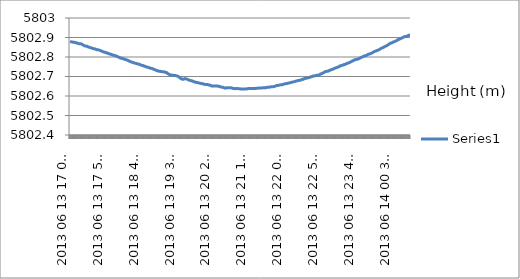
| Category | Series 0 |
|---|---|
| 2013 06 13 17 00 15 | 5802.88 |
| 2013 06 13 17 00 30 | 5802.88 |
| 2013 06 13 17 00 45 | 5802.879 |
| 2013 06 13 17 01 00 | 5802.879 |
| 2013 06 13 17 01 15 | 5802.878 |
| 2013 06 13 17 01 30 | 5802.878 |
| 2013 06 13 17 01 45 | 5802.878 |
| 2013 06 13 17 02 00 | 5802.877 |
| 2013 06 13 17 02 15 | 5802.878 |
| 2013 06 13 17 02 30 | 5802.877 |
| 2013 06 13 17 02 45 | 5802.877 |
| 2013 06 13 17 03 00 | 5802.877 |
| 2013 06 13 17 03 15 | 5802.877 |
| 2013 06 13 17 03 30 | 5802.877 |
| 2013 06 13 17 03 45 | 5802.877 |
| 2013 06 13 17 04 00 | 5802.876 |
| 2013 06 13 17 04 15 | 5802.877 |
| 2013 06 13 17 04 30 | 5802.876 |
| 2013 06 13 17 04 45 | 5802.875 |
| 2013 06 13 17 05 00 | 5802.876 |
| 2013 06 13 17 05 15 | 5802.874 |
| 2013 06 13 17 05 30 | 5802.875 |
| 2013 06 13 17 05 45 | 5802.875 |
| 2013 06 13 17 06 00 | 5802.874 |
| 2013 06 13 17 06 15 | 5802.875 |
| 2013 06 13 17 06 30 | 5802.874 |
| 2013 06 13 17 06 45 | 5802.873 |
| 2013 06 13 17 07 00 | 5802.874 |
| 2013 06 13 17 07 15 | 5802.873 |
| 2013 06 13 17 07 30 | 5802.873 |
| 2013 06 13 17 07 45 | 5802.873 |
| 2013 06 13 17 08 00 | 5802.873 |
| 2013 06 13 17 08 15 | 5802.873 |
| 2013 06 13 17 08 30 | 5802.873 |
| 2013 06 13 17 08 45 | 5802.873 |
| 2013 06 13 17 09 00 | 5802.873 |
| 2013 06 13 17 09 15 | 5802.872 |
| 2013 06 13 17 09 30 | 5802.872 |
| 2013 06 13 17 09 45 | 5802.872 |
| 2013 06 13 17 10 00 | 5802.872 |
| 2013 06 13 17 10 15 | 5802.871 |
| 2013 06 13 17 10 30 | 5802.871 |
| 2013 06 13 17 10 45 | 5802.87 |
| 2013 06 13 17 11 00 | 5802.869 |
| 2013 06 13 17 11 15 | 5802.869 |
| 2013 06 13 17 11 30 | 5802.869 |
| 2013 06 13 17 11 45 | 5802.869 |
| 2013 06 13 17 12 00 | 5802.869 |
| 2013 06 13 17 12 15 | 5802.868 |
| 2013 06 13 17 12 30 | 5802.869 |
| 2013 06 13 17 12 45 | 5802.869 |
| 2013 06 13 17 13 00 | 5802.869 |
| 2013 06 13 17 13 15 | 5802.868 |
| 2013 06 13 17 13 30 | 5802.868 |
| 2013 06 13 17 13 45 | 5802.868 |
| 2013 06 13 17 14 00 | 5802.868 |
| 2013 06 13 17 14 15 | 5802.868 |
| 2013 06 13 17 14 30 | 5802.867 |
| 2013 06 13 17 14 45 | 5802.867 |
| 2013 06 13 17 15 00 | 5802.867 |
| 2013 06 13 17 15 15 | 5802.867 |
| 2013 06 13 17 15 30 | 5802.866 |
| 2013 06 13 17 15 45 | 5802.865 |
| 2013 06 13 17 16 00 | 5802.866 |
| 2013 06 13 17 16 15 | 5802.865 |
| 2013 06 13 17 16 30 | 5802.865 |
| 2013 06 13 17 16 45 | 5802.865 |
| 2013 06 13 17 17 00 | 5802.864 |
| 2013 06 13 17 17 15 | 5802.864 |
| 2013 06 13 17 17 30 | 5802.863 |
| 2013 06 13 17 17 45 | 5802.863 |
| 2013 06 13 17 18 00 | 5802.862 |
| 2013 06 13 17 18 15 | 5802.862 |
| 2013 06 13 17 18 30 | 5802.861 |
| 2013 06 13 17 18 45 | 5802.86 |
| 2013 06 13 17 19 00 | 5802.861 |
| 2013 06 13 17 19 15 | 5802.86 |
| 2013 06 13 17 19 30 | 5802.859 |
| 2013 06 13 17 19 45 | 5802.859 |
| 2013 06 13 17 20 00 | 5802.858 |
| 2013 06 13 17 20 15 | 5802.857 |
| 2013 06 13 17 20 30 | 5802.857 |
| 2013 06 13 17 20 45 | 5802.857 |
| 2013 06 13 17 21 00 | 5802.856 |
| 2013 06 13 17 21 15 | 5802.856 |
| 2013 06 13 17 21 30 | 5802.856 |
| 2013 06 13 17 21 45 | 5802.856 |
| 2013 06 13 17 22 00 | 5802.855 |
| 2013 06 13 17 22 15 | 5802.855 |
| 2013 06 13 17 22 30 | 5802.855 |
| 2013 06 13 17 22 45 | 5802.855 |
| 2013 06 13 17 23 00 | 5802.855 |
| 2013 06 13 17 23 15 | 5802.855 |
| 2013 06 13 17 23 30 | 5802.854 |
| 2013 06 13 17 23 45 | 5802.854 |
| 2013 06 13 17 24 00 | 5802.854 |
| 2013 06 13 17 24 15 | 5802.854 |
| 2013 06 13 17 24 30 | 5802.854 |
| 2013 06 13 17 24 45 | 5802.852 |
| 2013 06 13 17 25 00 | 5802.852 |
| 2013 06 13 17 25 15 | 5802.852 |
| 2013 06 13 17 25 30 | 5802.852 |
| 2013 06 13 17 25 45 | 5802.851 |
| 2013 06 13 17 26 00 | 5802.852 |
| 2013 06 13 17 26 15 | 5802.851 |
| 2013 06 13 17 26 30 | 5802.851 |
| 2013 06 13 17 26 45 | 5802.851 |
| 2013 06 13 17 27 00 | 5802.85 |
| 2013 06 13 17 27 15 | 5802.85 |
| 2013 06 13 17 27 30 | 5802.849 |
| 2013 06 13 17 27 45 | 5802.849 |
| 2013 06 13 17 28 00 | 5802.848 |
| 2013 06 13 17 28 15 | 5802.849 |
| 2013 06 13 17 28 30 | 5802.849 |
| 2013 06 13 17 28 45 | 5802.847 |
| 2013 06 13 17 29 00 | 5802.848 |
| 2013 06 13 17 29 15 | 5802.847 |
| 2013 06 13 17 29 30 | 5802.846 |
| 2013 06 13 17 29 45 | 5802.847 |
| 2013 06 13 17 30 00 | 5802.846 |
| 2013 06 13 17 30 15 | 5802.846 |
| 2013 06 13 17 30 30 | 5802.846 |
| 2013 06 13 17 30 45 | 5802.845 |
| 2013 06 13 17 31 00 | 5802.845 |
| 2013 06 13 17 31 15 | 5802.844 |
| 2013 06 13 17 31 30 | 5802.844 |
| 2013 06 13 17 31 45 | 5802.844 |
| 2013 06 13 17 32 00 | 5802.844 |
| 2013 06 13 17 32 15 | 5802.842 |
| 2013 06 13 17 32 30 | 5802.843 |
| 2013 06 13 17 32 45 | 5802.842 |
| 2013 06 13 17 33 00 | 5802.843 |
| 2013 06 13 17 33 15 | 5802.842 |
| 2013 06 13 17 33 30 | 5802.842 |
| 2013 06 13 17 33 45 | 5802.841 |
| 2013 06 13 17 34 00 | 5802.842 |
| 2013 06 13 17 34 15 | 5802.842 |
| 2013 06 13 17 34 30 | 5802.841 |
| 2013 06 13 17 34 45 | 5802.841 |
| 2013 06 13 17 35 00 | 5802.841 |
| 2013 06 13 17 35 15 | 5802.84 |
| 2013 06 13 17 35 30 | 5802.84 |
| 2013 06 13 17 35 45 | 5802.84 |
| 2013 06 13 17 36 00 | 5802.841 |
| 2013 06 13 17 36 15 | 5802.84 |
| 2013 06 13 17 36 30 | 5802.839 |
| 2013 06 13 17 36 45 | 5802.839 |
| 2013 06 13 17 37 00 | 5802.839 |
| 2013 06 13 17 37 15 | 5802.839 |
| 2013 06 13 17 37 30 | 5802.838 |
| 2013 06 13 17 37 45 | 5802.837 |
| 2013 06 13 17 38 00 | 5802.838 |
| 2013 06 13 17 38 15 | 5802.837 |
| 2013 06 13 17 38 30 | 5802.837 |
| 2013 06 13 17 38 45 | 5802.838 |
| 2013 06 13 17 39 00 | 5802.836 |
| 2013 06 13 17 39 15 | 5802.837 |
| 2013 06 13 17 39 30 | 5802.836 |
| 2013 06 13 17 39 45 | 5802.836 |
| 2013 06 13 17 40 00 | 5802.836 |
| 2013 06 13 17 40 15 | 5802.835 |
| 2013 06 13 17 40 30 | 5802.835 |
| 2013 06 13 17 40 45 | 5802.835 |
| 2013 06 13 17 41 00 | 5802.834 |
| 2013 06 13 17 41 15 | 5802.834 |
| 2013 06 13 17 41 30 | 5802.833 |
| 2013 06 13 17 41 45 | 5802.833 |
| 2013 06 13 17 42 00 | 5802.833 |
| 2013 06 13 17 42 15 | 5802.833 |
| 2013 06 13 17 42 30 | 5802.832 |
| 2013 06 13 17 42 45 | 5802.832 |
| 2013 06 13 17 43 00 | 5802.832 |
| 2013 06 13 17 43 15 | 5802.831 |
| 2013 06 13 17 43 30 | 5802.831 |
| 2013 06 13 17 43 45 | 5802.831 |
| 2013 06 13 17 44 00 | 5802.83 |
| 2013 06 13 17 44 15 | 5802.83 |
| 2013 06 13 17 44 30 | 5802.829 |
| 2013 06 13 17 44 45 | 5802.829 |
| 2013 06 13 17 45 00 | 5802.829 |
| 2013 06 13 17 45 15 | 5802.828 |
| 2013 06 13 17 45 30 | 5802.828 |
| 2013 06 13 17 45 45 | 5802.827 |
| 2013 06 13 17 46 00 | 5802.827 |
| 2013 06 13 17 46 15 | 5802.827 |
| 2013 06 13 17 46 30 | 5802.827 |
| 2013 06 13 17 46 45 | 5802.826 |
| 2013 06 13 17 47 00 | 5802.826 |
| 2013 06 13 17 47 15 | 5802.825 |
| 2013 06 13 17 47 30 | 5802.826 |
| 2013 06 13 17 47 45 | 5802.825 |
| 2013 06 13 17 48 00 | 5802.824 |
| 2013 06 13 17 48 15 | 5802.824 |
| 2013 06 13 17 48 30 | 5802.824 |
| 2013 06 13 17 48 45 | 5802.823 |
| 2013 06 13 17 49 00 | 5802.824 |
| 2013 06 13 17 49 15 | 5802.823 |
| 2013 06 13 17 49 30 | 5802.823 |
| 2013 06 13 17 49 45 | 5802.823 |
| 2013 06 13 17 50 00 | 5802.822 |
| 2013 06 13 17 50 15 | 5802.821 |
| 2013 06 13 17 50 30 | 5802.821 |
| 2013 06 13 17 50 45 | 5802.822 |
| 2013 06 13 17 51 00 | 5802.821 |
| 2013 06 13 17 51 15 | 5802.821 |
| 2013 06 13 17 51 30 | 5802.821 |
| 2013 06 13 17 51 45 | 5802.82 |
| 2013 06 13 17 52 00 | 5802.82 |
| 2013 06 13 17 52 15 | 5802.82 |
| 2013 06 13 17 52 30 | 5802.819 |
| 2013 06 13 17 52 45 | 5802.82 |
| 2013 06 13 17 53 00 | 5802.819 |
| 2013 06 13 17 53 15 | 5802.818 |
| 2013 06 13 17 53 30 | 5802.818 |
| 2013 06 13 17 53 45 | 5802.818 |
| 2013 06 13 17 54 00 | 5802.817 |
| 2013 06 13 17 54 15 | 5802.817 |
| 2013 06 13 17 54 30 | 5802.816 |
| 2013 06 13 17 54 45 | 5802.816 |
| 2013 06 13 17 55 00 | 5802.816 |
| 2013 06 13 17 55 15 | 5802.815 |
| 2013 06 13 17 55 30 | 5802.815 |
| 2013 06 13 17 55 45 | 5802.815 |
| 2013 06 13 17 56 00 | 5802.815 |
| 2013 06 13 17 56 15 | 5802.815 |
| 2013 06 13 17 56 30 | 5802.814 |
| 2013 06 13 17 56 45 | 5802.814 |
| 2013 06 13 17 57 00 | 5802.814 |
| 2013 06 13 17 57 15 | 5802.814 |
| 2013 06 13 17 57 30 | 5802.812 |
| 2013 06 13 17 57 45 | 5802.812 |
| 2013 06 13 17 58 00 | 5802.812 |
| 2013 06 13 17 58 15 | 5802.811 |
| 2013 06 13 17 58 30 | 5802.812 |
| 2013 06 13 17 58 45 | 5802.811 |
| 2013 06 13 17 59 00 | 5802.812 |
| 2013 06 13 17 59 15 | 5802.81 |
| 2013 06 13 17 59 30 | 5802.811 |
| 2013 06 13 17 59 45 | 5802.81 |
| 2013 06 13 18 00 15 | 5802.81 |
| 2013 06 13 18 00 30 | 5802.81 |
| 2013 06 13 18 00 45 | 5802.809 |
| 2013 06 13 18 01 00 | 5802.81 |
| 2013 06 13 18 01 15 | 5802.808 |
| 2013 06 13 18 01 30 | 5802.809 |
| 2013 06 13 18 01 45 | 5802.807 |
| 2013 06 13 18 02 00 | 5802.808 |
| 2013 06 13 18 02 15 | 5802.806 |
| 2013 06 13 18 02 30 | 5802.807 |
| 2013 06 13 18 02 45 | 5802.807 |
| 2013 06 13 18 03 00 | 5802.806 |
| 2013 06 13 18 03 15 | 5802.807 |
| 2013 06 13 18 03 30 | 5802.806 |
| 2013 06 13 18 03 45 | 5802.805 |
| 2013 06 13 18 04 00 | 5802.805 |
| 2013 06 13 18 04 15 | 5802.805 |
| 2013 06 13 18 04 30 | 5802.804 |
| 2013 06 13 18 04 45 | 5802.804 |
| 2013 06 13 18 05 00 | 5802.805 |
| 2013 06 13 18 05 15 | 5802.804 |
| 2013 06 13 18 05 30 | 5802.803 |
| 2013 06 13 18 05 45 | 5802.803 |
| 2013 06 13 18 06 00 | 5802.802 |
| 2013 06 13 18 06 15 | 5802.802 |
| 2013 06 13 18 06 30 | 5802.802 |
| 2013 06 13 18 06 45 | 5802.801 |
| 2013 06 13 18 07 00 | 5802.801 |
| 2013 06 13 18 07 15 | 5802.8 |
| 2013 06 13 18 07 30 | 5802.799 |
| 2013 06 13 18 07 45 | 5802.799 |
| 2013 06 13 18 08 00 | 5802.8 |
| 2013 06 13 18 08 15 | 5802.799 |
| 2013 06 13 18 08 30 | 5802.798 |
| 2013 06 13 18 08 45 | 5802.798 |
| 2013 06 13 18 09 00 | 5802.798 |
| 2013 06 13 18 09 15 | 5802.798 |
| 2013 06 13 18 09 30 | 5802.797 |
| 2013 06 13 18 09 45 | 5802.797 |
| 2013 06 13 18 10 00 | 5802.796 |
| 2013 06 13 18 10 15 | 5802.796 |
| 2013 06 13 18 10 30 | 5802.796 |
| 2013 06 13 18 10 45 | 5802.795 |
| 2013 06 13 18 11 00 | 5802.795 |
| 2013 06 13 18 11 15 | 5802.795 |
| 2013 06 13 18 11 30 | 5802.795 |
| 2013 06 13 18 11 45 | 5802.794 |
| 2013 06 13 18 12 00 | 5802.794 |
| 2013 06 13 18 12 15 | 5802.793 |
| 2013 06 13 18 12 30 | 5802.793 |
| 2013 06 13 18 12 45 | 5802.793 |
| 2013 06 13 18 13 00 | 5802.792 |
| 2013 06 13 18 13 15 | 5802.792 |
| 2013 06 13 18 13 30 | 5802.792 |
| 2013 06 13 18 13 45 | 5802.791 |
| 2013 06 13 18 14 00 | 5802.792 |
| 2013 06 13 18 14 15 | 5802.791 |
| 2013 06 13 18 14 30 | 5802.791 |
| 2013 06 13 18 14 45 | 5802.791 |
| 2013 06 13 18 15 00 | 5802.791 |
| 2013 06 13 18 15 15 | 5802.79 |
| 2013 06 13 18 15 30 | 5802.79 |
| 2013 06 13 18 15 45 | 5802.79 |
| 2013 06 13 18 16 00 | 5802.79 |
| 2013 06 13 18 16 15 | 5802.79 |
| 2013 06 13 18 16 30 | 5802.789 |
| 2013 06 13 18 16 45 | 5802.789 |
| 2013 06 13 18 17 00 | 5802.788 |
| 2013 06 13 18 17 15 | 5802.787 |
| 2013 06 13 18 17 30 | 5802.787 |
| 2013 06 13 18 17 45 | 5802.787 |
| 2013 06 13 18 18 00 | 5802.786 |
| 2013 06 13 18 18 15 | 5802.786 |
| 2013 06 13 18 18 30 | 5802.786 |
| 2013 06 13 18 18 45 | 5802.785 |
| 2013 06 13 18 19 00 | 5802.785 |
| 2013 06 13 18 19 15 | 5802.784 |
| 2013 06 13 18 19 30 | 5802.784 |
| 2013 06 13 18 19 45 | 5802.785 |
| 2013 06 13 18 20 00 | 5802.784 |
| 2013 06 13 18 20 15 | 5802.783 |
| 2013 06 13 18 20 30 | 5802.783 |
| 2013 06 13 18 20 45 | 5802.783 |
| 2013 06 13 18 21 00 | 5802.782 |
| 2013 06 13 18 21 15 | 5802.783 |
| 2013 06 13 18 21 30 | 5802.782 |
| 2013 06 13 18 21 45 | 5802.781 |
| 2013 06 13 18 22 00 | 5802.781 |
| 2013 06 13 18 22 15 | 5802.78 |
| 2013 06 13 18 22 30 | 5802.781 |
| 2013 06 13 18 22 45 | 5802.779 |
| 2013 06 13 18 23 00 | 5802.78 |
| 2013 06 13 18 23 15 | 5802.778 |
| 2013 06 13 18 23 30 | 5802.779 |
| 2013 06 13 18 23 45 | 5802.779 |
| 2013 06 13 18 24 00 | 5802.778 |
| 2013 06 13 18 24 15 | 5802.778 |
| 2013 06 13 18 24 30 | 5802.777 |
| 2013 06 13 18 24 45 | 5802.777 |
| 2013 06 13 18 25 00 | 5802.777 |
| 2013 06 13 18 25 15 | 5802.777 |
| 2013 06 13 18 25 30 | 5802.776 |
| 2013 06 13 18 25 45 | 5802.776 |
| 2013 06 13 18 26 00 | 5802.775 |
| 2013 06 13 18 26 15 | 5802.775 |
| 2013 06 13 18 26 30 | 5802.775 |
| 2013 06 13 18 26 45 | 5802.775 |
| 2013 06 13 18 27 00 | 5802.774 |
| 2013 06 13 18 27 15 | 5802.774 |
| 2013 06 13 18 27 30 | 5802.773 |
| 2013 06 13 18 27 45 | 5802.773 |
| 2013 06 13 18 28 00 | 5802.773 |
| 2013 06 13 18 28 15 | 5802.773 |
| 2013 06 13 18 28 30 | 5802.772 |
| 2013 06 13 18 28 45 | 5802.771 |
| 2013 06 13 18 29 00 | 5802.771 |
| 2013 06 13 18 29 15 | 5802.77 |
| 2013 06 13 18 29 30 | 5802.77 |
| 2013 06 13 18 29 45 | 5802.77 |
| 2013 06 13 18 30 00 | 5802.769 |
| 2013 06 13 18 30 15 | 5802.77 |
| 2013 06 13 18 30 30 | 5802.769 |
| 2013 06 13 18 30 45 | 5802.769 |
| 2013 06 13 18 31 00 | 5802.769 |
| 2013 06 13 18 31 15 | 5802.769 |
| 2013 06 13 18 31 30 | 5802.768 |
| 2013 06 13 18 31 45 | 5802.769 |
| 2013 06 13 18 32 00 | 5802.768 |
| 2013 06 13 18 32 15 | 5802.767 |
| 2013 06 13 18 32 30 | 5802.768 |
| 2013 06 13 18 32 45 | 5802.767 |
| 2013 06 13 18 33 00 | 5802.767 |
| 2013 06 13 18 33 15 | 5802.766 |
| 2013 06 13 18 33 30 | 5802.766 |
| 2013 06 13 18 33 45 | 5802.765 |
| 2013 06 13 18 34 00 | 5802.765 |
| 2013 06 13 18 34 15 | 5802.764 |
| 2013 06 13 18 34 30 | 5802.765 |
| 2013 06 13 18 34 45 | 5802.765 |
| 2013 06 13 18 35 00 | 5802.764 |
| 2013 06 13 18 35 15 | 5802.764 |
| 2013 06 13 18 35 30 | 5802.764 |
| 2013 06 13 18 35 45 | 5802.763 |
| 2013 06 13 18 36 00 | 5802.763 |
| 2013 06 13 18 36 15 | 5802.763 |
| 2013 06 13 18 36 30 | 5802.764 |
| 2013 06 13 18 36 45 | 5802.763 |
| 2013 06 13 18 37 00 | 5802.763 |
| 2013 06 13 18 37 15 | 5802.762 |
| 2013 06 13 18 37 30 | 5802.763 |
| 2013 06 13 18 37 45 | 5802.762 |
| 2013 06 13 18 38 00 | 5802.761 |
| 2013 06 13 18 38 15 | 5802.762 |
| 2013 06 13 18 38 30 | 5802.76 |
| 2013 06 13 18 38 45 | 5802.76 |
| 2013 06 13 18 39 00 | 5802.76 |
| 2013 06 13 18 39 15 | 5802.76 |
| 2013 06 13 18 39 30 | 5802.759 |
| 2013 06 13 18 39 45 | 5802.759 |
| 2013 06 13 18 40 00 | 5802.759 |
| 2013 06 13 18 40 15 | 5802.758 |
| 2013 06 13 18 40 30 | 5802.758 |
| 2013 06 13 18 40 45 | 5802.758 |
| 2013 06 13 18 41 00 | 5802.757 |
| 2013 06 13 18 41 15 | 5802.757 |
| 2013 06 13 18 41 30 | 5802.756 |
| 2013 06 13 18 41 45 | 5802.756 |
| 2013 06 13 18 42 00 | 5802.757 |
| 2013 06 13 18 42 15 | 5802.756 |
| 2013 06 13 18 42 30 | 5802.756 |
| 2013 06 13 18 42 45 | 5802.756 |
| 2013 06 13 18 43 00 | 5802.756 |
| 2013 06 13 18 43 15 | 5802.755 |
| 2013 06 13 18 43 30 | 5802.754 |
| 2013 06 13 18 43 45 | 5802.755 |
| 2013 06 13 18 44 00 | 5802.754 |
| 2013 06 13 18 44 15 | 5802.753 |
| 2013 06 13 18 44 30 | 5802.753 |
| 2013 06 13 18 44 45 | 5802.752 |
| 2013 06 13 18 45 00 | 5802.753 |
| 2013 06 13 18 45 15 | 5802.751 |
| 2013 06 13 18 45 30 | 5802.752 |
| 2013 06 13 18 45 45 | 5802.751 |
| 2013 06 13 18 46 00 | 5802.751 |
| 2013 06 13 18 46 15 | 5802.751 |
| 2013 06 13 18 46 30 | 5802.75 |
| 2013 06 13 18 46 45 | 5802.749 |
| 2013 06 13 18 47 00 | 5802.749 |
| 2013 06 13 18 47 15 | 5802.749 |
| 2013 06 13 18 47 30 | 5802.748 |
| 2013 06 13 18 47 45 | 5802.748 |
| 2013 06 13 18 48 00 | 5802.748 |
| 2013 06 13 18 48 15 | 5802.748 |
| 2013 06 13 18 48 30 | 5802.748 |
| 2013 06 13 18 48 45 | 5802.748 |
| 2013 06 13 18 49 00 | 5802.747 |
| 2013 06 13 18 49 15 | 5802.747 |
| 2013 06 13 18 49 30 | 5802.747 |
| 2013 06 13 18 49 45 | 5802.747 |
| 2013 06 13 18 50 00 | 5802.746 |
| 2013 06 13 18 50 15 | 5802.746 |
| 2013 06 13 18 50 30 | 5802.745 |
| 2013 06 13 18 50 45 | 5802.745 |
| 2013 06 13 18 51 00 | 5802.744 |
| 2013 06 13 18 51 15 | 5802.744 |
| 2013 06 13 18 51 30 | 5802.744 |
| 2013 06 13 18 51 45 | 5802.745 |
| 2013 06 13 18 52 00 | 5802.743 |
| 2013 06 13 18 52 15 | 5802.743 |
| 2013 06 13 18 52 30 | 5802.742 |
| 2013 06 13 18 52 45 | 5802.742 |
| 2013 06 13 18 53 00 | 5802.742 |
| 2013 06 13 18 53 15 | 5802.742 |
| 2013 06 13 18 53 30 | 5802.742 |
| 2013 06 13 18 53 45 | 5802.742 |
| 2013 06 13 18 54 00 | 5802.741 |
| 2013 06 13 18 54 15 | 5802.741 |
| 2013 06 13 18 54 30 | 5802.741 |
| 2013 06 13 18 54 45 | 5802.741 |
| 2013 06 13 18 55 00 | 5802.741 |
| 2013 06 13 18 55 15 | 5802.741 |
| 2013 06 13 18 55 30 | 5802.74 |
| 2013 06 13 18 55 45 | 5802.739 |
| 2013 06 13 18 56 00 | 5802.74 |
| 2013 06 13 18 56 15 | 5802.739 |
| 2013 06 13 18 56 30 | 5802.739 |
| 2013 06 13 18 56 45 | 5802.738 |
| 2013 06 13 18 57 00 | 5802.738 |
| 2013 06 13 18 57 15 | 5802.737 |
| 2013 06 13 18 57 30 | 5802.737 |
| 2013 06 13 18 57 45 | 5802.737 |
| 2013 06 13 18 58 00 | 5802.736 |
| 2013 06 13 18 58 15 | 5802.736 |
| 2013 06 13 18 58 30 | 5802.736 |
| 2013 06 13 18 58 45 | 5802.735 |
| 2013 06 13 18 59 00 | 5802.735 |
| 2013 06 13 18 59 15 | 5802.735 |
| 2013 06 13 18 59 30 | 5802.734 |
| 2013 06 13 18 59 45 | 5802.733 |
| 2013 06 13 19 00 15 | 5802.733 |
| 2013 06 13 19 00 30 | 5802.732 |
| 2013 06 13 19 00 45 | 5802.733 |
| 2013 06 13 19 01 00 | 5802.731 |
| 2013 06 13 19 01 15 | 5802.732 |
| 2013 06 13 19 01 30 | 5802.731 |
| 2013 06 13 19 01 45 | 5802.731 |
| 2013 06 13 19 02 00 | 5802.73 |
| 2013 06 13 19 02 15 | 5802.73 |
| 2013 06 13 19 02 30 | 5802.73 |
| 2013 06 13 19 02 45 | 5802.73 |
| 2013 06 13 19 03 00 | 5802.729 |
| 2013 06 13 19 03 15 | 5802.729 |
| 2013 06 13 19 03 30 | 5802.729 |
| 2013 06 13 19 03 45 | 5802.729 |
| 2013 06 13 19 04 00 | 5802.728 |
| 2013 06 13 19 04 15 | 5802.727 |
| 2013 06 13 19 04 30 | 5802.728 |
| 2013 06 13 19 04 45 | 5802.727 |
| 2013 06 13 19 05 00 | 5802.727 |
| 2013 06 13 19 05 15 | 5802.727 |
| 2013 06 13 19 05 30 | 5802.727 |
| 2013 06 13 19 05 45 | 5802.727 |
| 2013 06 13 19 06 00 | 5802.727 |
| 2013 06 13 19 06 15 | 5802.727 |
| 2013 06 13 19 06 30 | 5802.726 |
| 2013 06 13 19 06 45 | 5802.727 |
| 2013 06 13 19 07 00 | 5802.726 |
| 2013 06 13 19 07 15 | 5802.725 |
| 2013 06 13 19 07 30 | 5802.726 |
| 2013 06 13 19 07 45 | 5802.725 |
| 2013 06 13 19 08 00 | 5802.726 |
| 2013 06 13 19 08 15 | 5802.725 |
| 2013 06 13 19 08 30 | 5802.725 |
| 2013 06 13 19 08 45 | 5802.725 |
| 2013 06 13 19 09 00 | 5802.725 |
| 2013 06 13 19 09 15 | 5802.725 |
| 2013 06 13 19 09 30 | 5802.724 |
| 2013 06 13 19 09 45 | 5802.724 |
| 2013 06 13 19 10 00 | 5802.724 |
| 2013 06 13 19 10 15 | 5802.723 |
| 2013 06 13 19 10 30 | 5802.724 |
| 2013 06 13 19 10 45 | 5802.724 |
| 2013 06 13 19 11 00 | 5802.723 |
| 2013 06 13 19 11 15 | 5802.724 |
| 2013 06 13 19 11 30 | 5802.723 |
| 2013 06 13 19 11 45 | 5802.723 |
| 2013 06 13 19 12 00 | 5802.723 |
| 2013 06 13 19 12 15 | 5802.722 |
| 2013 06 13 19 12 30 | 5802.722 |
| 2013 06 13 19 12 45 | 5802.723 |
| 2013 06 13 19 13 00 | 5802.722 |
| 2013 06 13 19 13 15 | 5802.722 |
| 2013 06 13 19 13 30 | 5802.722 |
| 2013 06 13 19 13 45 | 5802.721 |
| 2013 06 13 19 14 00 | 5802.721 |
| 2013 06 13 19 14 15 | 5802.721 |
| 2013 06 13 19 14 30 | 5802.721 |
| 2013 06 13 19 14 45 | 5802.721 |
| 2013 06 13 19 15 00 | 5802.721 |
| 2013 06 13 19 15 15 | 5802.72 |
| 2013 06 13 19 15 30 | 5802.72 |
| 2013 06 13 19 15 45 | 5802.72 |
| 2013 06 13 19 16 00 | 5802.72 |
| 2013 06 13 19 16 15 | 5802.719 |
| 2013 06 13 19 16 30 | 5802.718 |
| 2013 06 13 19 16 45 | 5802.718 |
| 2013 06 13 19 17 00 | 5802.717 |
| 2013 06 13 19 17 15 | 5802.716 |
| 2013 06 13 19 17 30 | 5802.716 |
| 2013 06 13 19 17 45 | 5802.715 |
| 2013 06 13 19 18 00 | 5802.715 |
| 2013 06 13 19 18 15 | 5802.713 |
| 2013 06 13 19 18 30 | 5802.712 |
| 2013 06 13 19 18 45 | 5802.712 |
| 2013 06 13 19 19 00 | 5802.711 |
| 2013 06 13 19 19 15 | 5802.711 |
| 2013 06 13 19 19 30 | 5802.71 |
| 2013 06 13 19 19 45 | 5802.709 |
| 2013 06 13 19 20 00 | 5802.708 |
| 2013 06 13 19 20 15 | 5802.709 |
| 2013 06 13 19 20 30 | 5802.708 |
| 2013 06 13 19 20 45 | 5802.708 |
| 2013 06 13 19 21 00 | 5802.708 |
| 2013 06 13 19 21 15 | 5802.708 |
| 2013 06 13 19 21 30 | 5802.708 |
| 2013 06 13 19 21 45 | 5802.708 |
| 2013 06 13 19 22 00 | 5802.708 |
| 2013 06 13 19 22 15 | 5802.708 |
| 2013 06 13 19 22 30 | 5802.708 |
| 2013 06 13 19 22 45 | 5802.707 |
| 2013 06 13 19 23 00 | 5802.708 |
| 2013 06 13 19 23 15 | 5802.707 |
| 2013 06 13 19 23 30 | 5802.708 |
| 2013 06 13 19 23 45 | 5802.707 |
| 2013 06 13 19 24 00 | 5802.706 |
| 2013 06 13 19 24 15 | 5802.706 |
| 2013 06 13 19 24 30 | 5802.706 |
| 2013 06 13 19 24 45 | 5802.706 |
| 2013 06 13 19 25 00 | 5802.706 |
| 2013 06 13 19 25 15 | 5802.705 |
| 2013 06 13 19 25 30 | 5802.705 |
| 2013 06 13 19 25 45 | 5802.705 |
| 2013 06 13 19 26 00 | 5802.706 |
| 2013 06 13 19 26 15 | 5802.705 |
| 2013 06 13 19 26 30 | 5802.705 |
| 2013 06 13 19 26 45 | 5802.705 |
| 2013 06 13 19 27 00 | 5802.705 |
| 2013 06 13 19 27 15 | 5802.705 |
| 2013 06 13 19 27 30 | 5802.705 |
| 2013 06 13 19 27 45 | 5802.705 |
| 2013 06 13 19 28 00 | 5802.705 |
| 2013 06 13 19 28 15 | 5802.704 |
| 2013 06 13 19 28 30 | 5802.704 |
| 2013 06 13 19 28 45 | 5802.704 |
| 2013 06 13 19 29 00 | 5802.704 |
| 2013 06 13 19 29 15 | 5802.703 |
| 2013 06 13 19 29 30 | 5802.704 |
| 2013 06 13 19 29 45 | 5802.703 |
| 2013 06 13 19 30 00 | 5802.703 |
| 2013 06 13 19 30 15 | 5802.702 |
| 2013 06 13 19 30 30 | 5802.703 |
| 2013 06 13 19 30 45 | 5802.702 |
| 2013 06 13 19 31 00 | 5802.702 |
| 2013 06 13 19 31 15 | 5802.701 |
| 2013 06 13 19 31 30 | 5802.701 |
| 2013 06 13 19 31 45 | 5802.701 |
| 2013 06 13 19 32 00 | 5802.701 |
| 2013 06 13 19 32 15 | 5802.7 |
| 2013 06 13 19 32 30 | 5802.699 |
| 2013 06 13 19 32 45 | 5802.699 |
| 2013 06 13 19 33 00 | 5802.698 |
| 2013 06 13 19 33 15 | 5802.698 |
| 2013 06 13 19 33 30 | 5802.696 |
| 2013 06 13 19 33 45 | 5802.696 |
| 2013 06 13 19 34 00 | 5802.694 |
| 2013 06 13 19 34 15 | 5802.693 |
| 2013 06 13 19 34 30 | 5802.693 |
| 2013 06 13 19 34 45 | 5802.692 |
| 2013 06 13 19 35 00 | 5802.691 |
| 2013 06 13 19 35 15 | 5802.691 |
| 2013 06 13 19 35 30 | 5802.69 |
| 2013 06 13 19 35 45 | 5802.69 |
| 2013 06 13 19 36 00 | 5802.69 |
| 2013 06 13 19 36 15 | 5802.689 |
| 2013 06 13 19 36 30 | 5802.689 |
| 2013 06 13 19 36 45 | 5802.688 |
| 2013 06 13 19 37 00 | 5802.688 |
| 2013 06 13 19 37 15 | 5802.687 |
| 2013 06 13 19 37 30 | 5802.688 |
| 2013 06 13 19 37 45 | 5802.686 |
| 2013 06 13 19 38 00 | 5802.686 |
| 2013 06 13 19 38 15 | 5802.685 |
| 2013 06 13 19 38 30 | 5802.686 |
| 2013 06 13 19 38 45 | 5802.685 |
| 2013 06 13 19 39 00 | 5802.686 |
| 2013 06 13 19 39 15 | 5802.685 |
| 2013 06 13 19 39 30 | 5802.686 |
| 2013 06 13 19 39 45 | 5802.685 |
| 2013 06 13 19 40 00 | 5802.688 |
| 2013 06 13 19 40 15 | 5802.687 |
| 2013 06 13 19 40 30 | 5802.688 |
| 2013 06 13 19 40 45 | 5802.689 |
| 2013 06 13 19 41 00 | 5802.689 |
| 2013 06 13 19 41 15 | 5802.689 |
| 2013 06 13 19 41 30 | 5802.689 |
| 2013 06 13 19 41 45 | 5802.69 |
| 2013 06 13 19 42 00 | 5802.689 |
| 2013 06 13 19 42 15 | 5802.689 |
| 2013 06 13 19 42 30 | 5802.689 |
| 2013 06 13 19 42 45 | 5802.688 |
| 2013 06 13 19 43 00 | 5802.689 |
| 2013 06 13 19 43 15 | 5802.688 |
| 2013 06 13 19 43 30 | 5802.686 |
| 2013 06 13 19 43 45 | 5802.687 |
| 2013 06 13 19 44 00 | 5802.686 |
| 2013 06 13 19 44 15 | 5802.687 |
| 2013 06 13 19 44 30 | 5802.686 |
| 2013 06 13 19 44 45 | 5802.685 |
| 2013 06 13 19 45 00 | 5802.685 |
| 2013 06 13 19 45 15 | 5802.684 |
| 2013 06 13 19 45 30 | 5802.684 |
| 2013 06 13 19 45 45 | 5802.684 |
| 2013 06 13 19 46 00 | 5802.683 |
| 2013 06 13 19 46 15 | 5802.683 |
| 2013 06 13 19 46 30 | 5802.683 |
| 2013 06 13 19 46 45 | 5802.682 |
| 2013 06 13 19 47 00 | 5802.682 |
| 2013 06 13 19 47 15 | 5802.681 |
| 2013 06 13 19 47 30 | 5802.682 |
| 2013 06 13 19 47 45 | 5802.681 |
| 2013 06 13 19 48 00 | 5802.681 |
| 2013 06 13 19 48 15 | 5802.681 |
| 2013 06 13 19 48 30 | 5802.68 |
| 2013 06 13 19 48 45 | 5802.68 |
| 2013 06 13 19 49 00 | 5802.68 |
| 2013 06 13 19 49 15 | 5802.68 |
| 2013 06 13 19 49 30 | 5802.679 |
| 2013 06 13 19 49 45 | 5802.678 |
| 2013 06 13 19 50 00 | 5802.678 |
| 2013 06 13 19 50 15 | 5802.678 |
| 2013 06 13 19 50 30 | 5802.678 |
| 2013 06 13 19 50 45 | 5802.677 |
| 2013 06 13 19 51 00 | 5802.677 |
| 2013 06 13 19 51 15 | 5802.677 |
| 2013 06 13 19 51 30 | 5802.677 |
| 2013 06 13 19 51 45 | 5802.677 |
| 2013 06 13 19 52 00 | 5802.677 |
| 2013 06 13 19 52 15 | 5802.677 |
| 2013 06 13 19 52 30 | 5802.676 |
| 2013 06 13 19 52 45 | 5802.676 |
| 2013 06 13 19 53 00 | 5802.676 |
| 2013 06 13 19 53 15 | 5802.675 |
| 2013 06 13 19 53 30 | 5802.675 |
| 2013 06 13 19 53 45 | 5802.674 |
| 2013 06 13 19 54 00 | 5802.673 |
| 2013 06 13 19 54 15 | 5802.673 |
| 2013 06 13 19 54 30 | 5802.673 |
| 2013 06 13 19 54 45 | 5802.672 |
| 2013 06 13 19 55 00 | 5802.671 |
| 2013 06 13 19 55 15 | 5802.672 |
| 2013 06 13 19 55 30 | 5802.671 |
| 2013 06 13 19 55 45 | 5802.671 |
| 2013 06 13 19 56 00 | 5802.67 |
| 2013 06 13 19 56 15 | 5802.671 |
| 2013 06 13 19 56 30 | 5802.67 |
| 2013 06 13 19 56 45 | 5802.67 |
| 2013 06 13 19 57 00 | 5802.669 |
| 2013 06 13 19 57 15 | 5802.67 |
| 2013 06 13 19 57 30 | 5802.669 |
| 2013 06 13 19 57 45 | 5802.669 |
| 2013 06 13 19 58 00 | 5802.668 |
| 2013 06 13 19 58 15 | 5802.669 |
| 2013 06 13 19 58 30 | 5802.668 |
| 2013 06 13 19 58 45 | 5802.669 |
| 2013 06 13 19 59 00 | 5802.668 |
| 2013 06 13 19 59 15 | 5802.669 |
| 2013 06 13 19 59 30 | 5802.668 |
| 2013 06 13 19 59 45 | 5802.668 |
| 2013 06 13 20 00 15 | 5802.668 |
| 2013 06 13 20 00 30 | 5802.667 |
| 2013 06 13 20 00 45 | 5802.666 |
| 2013 06 13 20 01 00 | 5802.667 |
| 2013 06 13 20 01 15 | 5802.666 |
| 2013 06 13 20 01 30 | 5802.665 |
| 2013 06 13 20 01 45 | 5802.666 |
| 2013 06 13 20 02 00 | 5802.666 |
| 2013 06 13 20 02 15 | 5802.666 |
| 2013 06 13 20 02 30 | 5802.666 |
| 2013 06 13 20 02 45 | 5802.666 |
| 2013 06 13 20 03 00 | 5802.666 |
| 2013 06 13 20 03 15 | 5802.666 |
| 2013 06 13 20 03 30 | 5802.665 |
| 2013 06 13 20 03 45 | 5802.664 |
| 2013 06 13 20 04 00 | 5802.664 |
| 2013 06 13 20 04 15 | 5802.664 |
| 2013 06 13 20 04 30 | 5802.664 |
| 2013 06 13 20 04 45 | 5802.664 |
| 2013 06 13 20 05 00 | 5802.664 |
| 2013 06 13 20 05 15 | 5802.663 |
| 2013 06 13 20 05 30 | 5802.663 |
| 2013 06 13 20 05 45 | 5802.663 |
| 2013 06 13 20 06 00 | 5802.663 |
| 2013 06 13 20 06 15 | 5802.663 |
| 2013 06 13 20 06 30 | 5802.663 |
| 2013 06 13 20 06 45 | 5802.663 |
| 2013 06 13 20 07 00 | 5802.662 |
| 2013 06 13 20 07 15 | 5802.662 |
| 2013 06 13 20 07 30 | 5802.662 |
| 2013 06 13 20 07 45 | 5802.661 |
| 2013 06 13 20 08 00 | 5802.661 |
| 2013 06 13 20 08 15 | 5802.66 |
| 2013 06 13 20 08 30 | 5802.66 |
| 2013 06 13 20 08 45 | 5802.659 |
| 2013 06 13 20 09 00 | 5802.66 |
| 2013 06 13 20 09 15 | 5802.66 |
| 2013 06 13 20 09 30 | 5802.659 |
| 2013 06 13 20 09 45 | 5802.659 |
| 2013 06 13 20 10 00 | 5802.659 |
| 2013 06 13 20 10 15 | 5802.659 |
| 2013 06 13 20 10 30 | 5802.66 |
| 2013 06 13 20 10 45 | 5802.66 |
| 2013 06 13 20 11 00 | 5802.659 |
| 2013 06 13 20 11 15 | 5802.659 |
| 2013 06 13 20 11 30 | 5802.659 |
| 2013 06 13 20 11 45 | 5802.66 |
| 2013 06 13 20 12 00 | 5802.66 |
| 2013 06 13 20 12 15 | 5802.66 |
| 2013 06 13 20 12 30 | 5802.659 |
| 2013 06 13 20 12 45 | 5802.659 |
| 2013 06 13 20 13 00 | 5802.659 |
| 2013 06 13 20 13 15 | 5802.659 |
| 2013 06 13 20 13 30 | 5802.658 |
| 2013 06 13 20 13 45 | 5802.658 |
| 2013 06 13 20 14 00 | 5802.658 |
| 2013 06 13 20 14 15 | 5802.658 |
| 2013 06 13 20 14 30 | 5802.657 |
| 2013 06 13 20 14 45 | 5802.657 |
| 2013 06 13 20 15 00 | 5802.657 |
| 2013 06 13 20 15 15 | 5802.656 |
| 2013 06 13 20 15 30 | 5802.657 |
| 2013 06 13 20 15 45 | 5802.656 |
| 2013 06 13 20 16 00 | 5802.656 |
| 2013 06 13 20 16 15 | 5802.655 |
| 2013 06 13 20 16 30 | 5802.655 |
| 2013 06 13 20 16 45 | 5802.654 |
| 2013 06 13 20 17 00 | 5802.655 |
| 2013 06 13 20 17 15 | 5802.654 |
| 2013 06 13 20 17 30 | 5802.655 |
| 2013 06 13 20 17 45 | 5802.654 |
| 2013 06 13 20 18 00 | 5802.655 |
| 2013 06 13 20 18 15 | 5802.653 |
| 2013 06 13 20 18 30 | 5802.654 |
| 2013 06 13 20 18 45 | 5802.653 |
| 2013 06 13 20 19 00 | 5802.652 |
| 2013 06 13 20 19 15 | 5802.653 |
| 2013 06 13 20 19 30 | 5802.653 |
| 2013 06 13 20 19 45 | 5802.652 |
| 2013 06 13 20 20 00 | 5802.653 |
| 2013 06 13 20 20 15 | 5802.653 |
| 2013 06 13 20 20 30 | 5802.652 |
| 2013 06 13 20 20 45 | 5802.653 |
| 2013 06 13 20 21 00 | 5802.653 |
| 2013 06 13 20 21 15 | 5802.652 |
| 2013 06 13 20 21 30 | 5802.652 |
| 2013 06 13 20 21 45 | 5802.652 |
| 2013 06 13 20 22 00 | 5802.651 |
| 2013 06 13 20 22 15 | 5802.652 |
| 2013 06 13 20 22 30 | 5802.651 |
| 2013 06 13 20 22 45 | 5802.652 |
| 2013 06 13 20 23 00 | 5802.652 |
| 2013 06 13 20 23 15 | 5802.652 |
| 2013 06 13 20 23 30 | 5802.652 |
| 2013 06 13 20 23 45 | 5802.652 |
| 2013 06 13 20 24 00 | 5802.652 |
| 2013 06 13 20 24 15 | 5802.652 |
| 2013 06 13 20 24 30 | 5802.652 |
| 2013 06 13 20 24 45 | 5802.651 |
| 2013 06 13 20 25 00 | 5802.651 |
| 2013 06 13 20 25 15 | 5802.651 |
| 2013 06 13 20 25 30 | 5802.651 |
| 2013 06 13 20 25 45 | 5802.651 |
| 2013 06 13 20 26 00 | 5802.651 |
| 2013 06 13 20 26 15 | 5802.651 |
| 2013 06 13 20 26 30 | 5802.652 |
| 2013 06 13 20 26 45 | 5802.652 |
| 2013 06 13 20 27 00 | 5802.651 |
| 2013 06 13 20 27 15 | 5802.651 |
| 2013 06 13 20 27 30 | 5802.651 |
| 2013 06 13 20 27 45 | 5802.651 |
| 2013 06 13 20 28 00 | 5802.65 |
| 2013 06 13 20 28 15 | 5802.65 |
| 2013 06 13 20 28 30 | 5802.65 |
| 2013 06 13 20 28 45 | 5802.65 |
| 2013 06 13 20 29 00 | 5802.65 |
| 2013 06 13 20 29 15 | 5802.65 |
| 2013 06 13 20 29 30 | 5802.65 |
| 2013 06 13 20 29 45 | 5802.649 |
| 2013 06 13 20 30 00 | 5802.649 |
| 2013 06 13 20 30 15 | 5802.648 |
| 2013 06 13 20 30 30 | 5802.648 |
| 2013 06 13 20 30 45 | 5802.648 |
| 2013 06 13 20 31 00 | 5802.648 |
| 2013 06 13 20 31 15 | 5802.648 |
| 2013 06 13 20 31 30 | 5802.647 |
| 2013 06 13 20 31 45 | 5802.647 |
| 2013 06 13 20 32 00 | 5802.646 |
| 2013 06 13 20 32 15 | 5802.646 |
| 2013 06 13 20 32 30 | 5802.646 |
| 2013 06 13 20 32 45 | 5802.646 |
| 2013 06 13 20 33 00 | 5802.646 |
| 2013 06 13 20 33 15 | 5802.646 |
| 2013 06 13 20 33 30 | 5802.646 |
| 2013 06 13 20 33 45 | 5802.645 |
| 2013 06 13 20 34 00 | 5802.645 |
| 2013 06 13 20 34 15 | 5802.645 |
| 2013 06 13 20 34 30 | 5802.645 |
| 2013 06 13 20 34 45 | 5802.645 |
| 2013 06 13 20 35 00 | 5802.644 |
| 2013 06 13 20 35 15 | 5802.644 |
| 2013 06 13 20 35 30 | 5802.644 |
| 2013 06 13 20 35 45 | 5802.643 |
| 2013 06 13 20 36 00 | 5802.643 |
| 2013 06 13 20 36 15 | 5802.643 |
| 2013 06 13 20 36 30 | 5802.642 |
| 2013 06 13 20 36 45 | 5802.643 |
| 2013 06 13 20 37 00 | 5802.641 |
| 2013 06 13 20 37 15 | 5802.642 |
| 2013 06 13 20 37 30 | 5802.641 |
| 2013 06 13 20 37 45 | 5802.641 |
| 2013 06 13 20 38 00 | 5802.64 |
| 2013 06 13 20 38 15 | 5802.641 |
| 2013 06 13 20 38 30 | 5802.64 |
| 2013 06 13 20 38 45 | 5802.641 |
| 2013 06 13 20 39 00 | 5802.64 |
| 2013 06 13 20 39 15 | 5802.641 |
| 2013 06 13 20 39 30 | 5802.641 |
| 2013 06 13 20 39 45 | 5802.641 |
| 2013 06 13 20 40 00 | 5802.641 |
| 2013 06 13 20 40 15 | 5802.64 |
| 2013 06 13 20 40 30 | 5802.64 |
| 2013 06 13 20 40 45 | 5802.64 |
| 2013 06 13 20 41 00 | 5802.641 |
| 2013 06 13 20 41 15 | 5802.64 |
| 2013 06 13 20 41 30 | 5802.642 |
| 2013 06 13 20 41 45 | 5802.641 |
| 2013 06 13 20 42 00 | 5802.642 |
| 2013 06 13 20 42 15 | 5802.641 |
| 2013 06 13 20 42 30 | 5802.641 |
| 2013 06 13 20 42 45 | 5802.64 |
| 2013 06 13 20 43 00 | 5802.641 |
| 2013 06 13 20 43 15 | 5802.641 |
| 2013 06 13 20 43 30 | 5802.642 |
| 2013 06 13 20 43 45 | 5802.641 |
| 2013 06 13 20 44 00 | 5802.642 |
| 2013 06 13 20 44 15 | 5802.641 |
| 2013 06 13 20 44 30 | 5802.642 |
| 2013 06 13 20 44 45 | 5802.641 |
| 2013 06 13 20 45 00 | 5802.642 |
| 2013 06 13 20 45 15 | 5802.641 |
| 2013 06 13 20 45 30 | 5802.641 |
| 2013 06 13 20 45 45 | 5802.64 |
| 2013 06 13 20 46 00 | 5802.642 |
| 2013 06 13 20 46 15 | 5802.641 |
| 2013 06 13 20 46 30 | 5802.642 |
| 2013 06 13 20 46 45 | 5802.641 |
| 2013 06 13 20 47 00 | 5802.641 |
| 2013 06 13 20 47 15 | 5802.64 |
| 2013 06 13 20 47 30 | 5802.641 |
| 2013 06 13 20 47 45 | 5802.64 |
| 2013 06 13 20 48 00 | 5802.64 |
| 2013 06 13 20 48 15 | 5802.64 |
| 2013 06 13 20 48 30 | 5802.64 |
| 2013 06 13 20 48 45 | 5802.64 |
| 2013 06 13 20 49 00 | 5802.639 |
| 2013 06 13 20 49 15 | 5802.639 |
| 2013 06 13 20 49 30 | 5802.639 |
| 2013 06 13 20 49 45 | 5802.638 |
| 2013 06 13 20 50 00 | 5802.638 |
| 2013 06 13 20 50 15 | 5802.638 |
| 2013 06 13 20 50 30 | 5802.638 |
| 2013 06 13 20 50 45 | 5802.637 |
| 2013 06 13 20 51 00 | 5802.638 |
| 2013 06 13 20 51 15 | 5802.638 |
| 2013 06 13 20 51 30 | 5802.638 |
| 2013 06 13 20 51 45 | 5802.637 |
| 2013 06 13 20 52 00 | 5802.637 |
| 2013 06 13 20 52 15 | 5802.637 |
| 2013 06 13 20 52 30 | 5802.637 |
| 2013 06 13 20 52 45 | 5802.637 |
| 2013 06 13 20 53 00 | 5802.636 |
| 2013 06 13 20 53 15 | 5802.636 |
| 2013 06 13 20 53 30 | 5802.637 |
| 2013 06 13 20 53 45 | 5802.637 |
| 2013 06 13 20 54 00 | 5802.637 |
| 2013 06 13 20 54 15 | 5802.637 |
| 2013 06 13 20 54 30 | 5802.636 |
| 2013 06 13 20 54 45 | 5802.637 |
| 2013 06 13 20 55 00 | 5802.638 |
| 2013 06 13 20 55 15 | 5802.637 |
| 2013 06 13 20 55 30 | 5802.637 |
| 2013 06 13 20 55 45 | 5802.637 |
| 2013 06 13 20 56 00 | 5802.637 |
| 2013 06 13 20 56 15 | 5802.638 |
| 2013 06 13 20 56 30 | 5802.637 |
| 2013 06 13 20 56 45 | 5802.637 |
| 2013 06 13 20 57 00 | 5802.637 |
| 2013 06 13 20 57 15 | 5802.637 |
| 2013 06 13 20 57 30 | 5802.638 |
| 2013 06 13 20 57 45 | 5802.637 |
| 2013 06 13 20 58 00 | 5802.637 |
| 2013 06 13 20 58 15 | 5802.638 |
| 2013 06 13 20 58 30 | 5802.637 |
| 2013 06 13 20 58 45 | 5802.637 |
| 2013 06 13 20 59 00 | 5802.636 |
| 2013 06 13 20 59 15 | 5802.636 |
| 2013 06 13 20 59 30 | 5802.636 |
| 2013 06 13 20 59 45 | 5802.636 |
| 2013 06 13 21 00 15 | 5802.637 |
| 2013 06 13 21 00 30 | 5802.636 |
| 2013 06 13 21 00 45 | 5802.636 |
| 2013 06 13 21 01 00 | 5802.636 |
| 2013 06 13 21 01 15 | 5802.636 |
| 2013 06 13 21 01 30 | 5802.636 |
| 2013 06 13 21 01 45 | 5802.636 |
| 2013 06 13 21 02 00 | 5802.636 |
| 2013 06 13 21 02 15 | 5802.636 |
| 2013 06 13 21 02 30 | 5802.636 |
| 2013 06 13 21 02 45 | 5802.636 |
| 2013 06 13 21 03 00 | 5802.636 |
| 2013 06 13 21 03 15 | 5802.636 |
| 2013 06 13 21 03 30 | 5802.636 |
| 2013 06 13 21 03 45 | 5802.636 |
| 2013 06 13 21 04 00 | 5802.636 |
| 2013 06 13 21 04 15 | 5802.635 |
| 2013 06 13 21 04 30 | 5802.636 |
| 2013 06 13 21 04 45 | 5802.636 |
| 2013 06 13 21 05 00 | 5802.637 |
| 2013 06 13 21 05 15 | 5802.636 |
| 2013 06 13 21 05 30 | 5802.636 |
| 2013 06 13 21 05 45 | 5802.636 |
| 2013 06 13 21 06 00 | 5802.636 |
| 2013 06 13 21 06 15 | 5802.635 |
| 2013 06 13 21 06 30 | 5802.636 |
| 2013 06 13 21 06 45 | 5802.636 |
| 2013 06 13 21 07 00 | 5802.636 |
| 2013 06 13 21 07 15 | 5802.636 |
| 2013 06 13 21 07 30 | 5802.636 |
| 2013 06 13 21 07 45 | 5802.635 |
| 2013 06 13 21 08 00 | 5802.636 |
| 2013 06 13 21 08 15 | 5802.635 |
| 2013 06 13 21 08 30 | 5802.636 |
| 2013 06 13 21 08 45 | 5802.636 |
| 2013 06 13 21 09 00 | 5802.636 |
| 2013 06 13 21 09 15 | 5802.636 |
| 2013 06 13 21 09 30 | 5802.636 |
| 2013 06 13 21 09 45 | 5802.636 |
| 2013 06 13 21 10 00 | 5802.636 |
| 2013 06 13 21 10 15 | 5802.637 |
| 2013 06 13 21 10 30 | 5802.637 |
| 2013 06 13 21 10 45 | 5802.637 |
| 2013 06 13 21 11 00 | 5802.637 |
| 2013 06 13 21 11 15 | 5802.637 |
| 2013 06 13 21 11 30 | 5802.638 |
| 2013 06 13 21 11 45 | 5802.638 |
| 2013 06 13 21 12 00 | 5802.638 |
| 2013 06 13 21 12 15 | 5802.637 |
| 2013 06 13 21 12 30 | 5802.637 |
| 2013 06 13 21 12 45 | 5802.637 |
| 2013 06 13 21 13 00 | 5802.637 |
| 2013 06 13 21 13 15 | 5802.637 |
| 2013 06 13 21 13 30 | 5802.637 |
| 2013 06 13 21 13 45 | 5802.638 |
| 2013 06 13 21 14 00 | 5802.638 |
| 2013 06 13 21 14 15 | 5802.637 |
| 2013 06 13 21 14 30 | 5802.638 |
| 2013 06 13 21 14 45 | 5802.638 |
| 2013 06 13 21 15 00 | 5802.638 |
| 2013 06 13 21 15 15 | 5802.637 |
| 2013 06 13 21 15 30 | 5802.638 |
| 2013 06 13 21 15 45 | 5802.638 |
| 2013 06 13 21 16 00 | 5802.638 |
| 2013 06 13 21 16 15 | 5802.637 |
| 2013 06 13 21 16 30 | 5802.638 |
| 2013 06 13 21 16 45 | 5802.638 |
| 2013 06 13 21 17 00 | 5802.638 |
| 2013 06 13 21 17 15 | 5802.638 |
| 2013 06 13 21 17 30 | 5802.638 |
| 2013 06 13 21 17 45 | 5802.639 |
| 2013 06 13 21 18 00 | 5802.638 |
| 2013 06 13 21 18 15 | 5802.639 |
| 2013 06 13 21 18 30 | 5802.638 |
| 2013 06 13 21 18 45 | 5802.638 |
| 2013 06 13 21 19 00 | 5802.638 |
| 2013 06 13 21 19 15 | 5802.639 |
| 2013 06 13 21 19 30 | 5802.638 |
| 2013 06 13 21 19 45 | 5802.638 |
| 2013 06 13 21 20 00 | 5802.638 |
| 2013 06 13 21 20 15 | 5802.639 |
| 2013 06 13 21 20 30 | 5802.637 |
| 2013 06 13 21 20 45 | 5802.638 |
| 2013 06 13 21 21 00 | 5802.638 |
| 2013 06 13 21 21 15 | 5802.639 |
| 2013 06 13 21 21 30 | 5802.638 |
| 2013 06 13 21 21 45 | 5802.639 |
| 2013 06 13 21 22 00 | 5802.639 |
| 2013 06 13 21 22 15 | 5802.64 |
| 2013 06 13 21 22 30 | 5802.639 |
| 2013 06 13 21 22 45 | 5802.639 |
| 2013 06 13 21 23 00 | 5802.64 |
| 2013 06 13 21 23 15 | 5802.64 |
| 2013 06 13 21 23 30 | 5802.639 |
| 2013 06 13 21 23 45 | 5802.64 |
| 2013 06 13 21 24 00 | 5802.64 |
| 2013 06 13 21 24 15 | 5802.639 |
| 2013 06 13 21 24 30 | 5802.64 |
| 2013 06 13 21 24 45 | 5802.639 |
| 2013 06 13 21 25 00 | 5802.64 |
| 2013 06 13 21 25 15 | 5802.64 |
| 2013 06 13 21 25 30 | 5802.639 |
| 2013 06 13 21 25 45 | 5802.64 |
| 2013 06 13 21 26 00 | 5802.64 |
| 2013 06 13 21 26 15 | 5802.641 |
| 2013 06 13 21 26 30 | 5802.64 |
| 2013 06 13 21 26 45 | 5802.641 |
| 2013 06 13 21 27 00 | 5802.64 |
| 2013 06 13 21 27 15 | 5802.641 |
| 2013 06 13 21 27 30 | 5802.641 |
| 2013 06 13 21 27 45 | 5802.641 |
| 2013 06 13 21 28 00 | 5802.641 |
| 2013 06 13 21 28 15 | 5802.641 |
| 2013 06 13 21 28 30 | 5802.641 |
| 2013 06 13 21 28 45 | 5802.641 |
| 2013 06 13 21 29 00 | 5802.64 |
| 2013 06 13 21 29 15 | 5802.641 |
| 2013 06 13 21 29 30 | 5802.64 |
| 2013 06 13 21 29 45 | 5802.641 |
| 2013 06 13 21 30 00 | 5802.64 |
| 2013 06 13 21 30 15 | 5802.641 |
| 2013 06 13 21 30 30 | 5802.64 |
| 2013 06 13 21 30 45 | 5802.641 |
| 2013 06 13 21 31 00 | 5802.64 |
| 2013 06 13 21 31 15 | 5802.641 |
| 2013 06 13 21 31 30 | 5802.641 |
| 2013 06 13 21 31 45 | 5802.641 |
| 2013 06 13 21 32 00 | 5802.641 |
| 2013 06 13 21 32 15 | 5802.642 |
| 2013 06 13 21 32 30 | 5802.642 |
| 2013 06 13 21 32 45 | 5802.642 |
| 2013 06 13 21 33 00 | 5802.642 |
| 2013 06 13 21 33 15 | 5802.642 |
| 2013 06 13 21 33 30 | 5802.642 |
| 2013 06 13 21 33 45 | 5802.641 |
| 2013 06 13 21 34 00 | 5802.642 |
| 2013 06 13 21 34 15 | 5802.641 |
| 2013 06 13 21 34 30 | 5802.642 |
| 2013 06 13 21 34 45 | 5802.641 |
| 2013 06 13 21 35 00 | 5802.642 |
| 2013 06 13 21 35 15 | 5802.642 |
| 2013 06 13 21 35 30 | 5802.642 |
| 2013 06 13 21 35 45 | 5802.642 |
| 2013 06 13 21 36 00 | 5802.643 |
| 2013 06 13 21 36 15 | 5802.643 |
| 2013 06 13 21 36 30 | 5802.643 |
| 2013 06 13 21 36 45 | 5802.644 |
| 2013 06 13 21 37 00 | 5802.645 |
| 2013 06 13 21 37 15 | 5802.645 |
| 2013 06 13 21 37 30 | 5802.644 |
| 2013 06 13 21 37 45 | 5802.645 |
| 2013 06 13 21 38 00 | 5802.645 |
| 2013 06 13 21 38 15 | 5802.645 |
| 2013 06 13 21 38 30 | 5802.645 |
| 2013 06 13 21 38 45 | 5802.645 |
| 2013 06 13 21 39 00 | 5802.645 |
| 2013 06 13 21 39 15 | 5802.645 |
| 2013 06 13 21 39 30 | 5802.645 |
| 2013 06 13 21 39 45 | 5802.645 |
| 2013 06 13 21 40 00 | 5802.645 |
| 2013 06 13 21 40 15 | 5802.645 |
| 2013 06 13 21 40 30 | 5802.646 |
| 2013 06 13 21 40 45 | 5802.646 |
| 2013 06 13 21 41 00 | 5802.646 |
| 2013 06 13 21 41 15 | 5802.646 |
| 2013 06 13 21 41 30 | 5802.646 |
| 2013 06 13 21 41 45 | 5802.646 |
| 2013 06 13 21 42 00 | 5802.646 |
| 2013 06 13 21 42 15 | 5802.646 |
| 2013 06 13 21 42 30 | 5802.647 |
| 2013 06 13 21 42 45 | 5802.647 |
| 2013 06 13 21 43 00 | 5802.647 |
| 2013 06 13 21 43 15 | 5802.647 |
| 2013 06 13 21 43 30 | 5802.648 |
| 2013 06 13 21 43 45 | 5802.648 |
| 2013 06 13 21 44 00 | 5802.648 |
| 2013 06 13 21 44 15 | 5802.648 |
| 2013 06 13 21 44 30 | 5802.648 |
| 2013 06 13 21 44 45 | 5802.648 |
| 2013 06 13 21 45 00 | 5802.648 |
| 2013 06 13 21 45 15 | 5802.648 |
| 2013 06 13 21 45 30 | 5802.648 |
| 2013 06 13 21 45 45 | 5802.648 |
| 2013 06 13 21 46 00 | 5802.648 |
| 2013 06 13 21 46 15 | 5802.648 |
| 2013 06 13 21 46 30 | 5802.649 |
| 2013 06 13 21 46 45 | 5802.65 |
| 2013 06 13 21 47 00 | 5802.649 |
| 2013 06 13 21 47 15 | 5802.649 |
| 2013 06 13 21 47 30 | 5802.649 |
| 2013 06 13 21 47 45 | 5802.649 |
| 2013 06 13 21 48 00 | 5802.65 |
| 2013 06 13 21 48 15 | 5802.65 |
| 2013 06 13 21 48 30 | 5802.651 |
| 2013 06 13 21 48 45 | 5802.651 |
| 2013 06 13 21 49 00 | 5802.65 |
| 2013 06 13 21 49 15 | 5802.651 |
| 2013 06 13 21 49 30 | 5802.652 |
| 2013 06 13 21 49 45 | 5802.652 |
| 2013 06 13 21 50 00 | 5802.652 |
| 2013 06 13 21 50 15 | 5802.653 |
| 2013 06 13 21 50 30 | 5802.652 |
| 2013 06 13 21 50 45 | 5802.654 |
| 2013 06 13 21 51 00 | 5802.653 |
| 2013 06 13 21 51 15 | 5802.653 |
| 2013 06 13 21 51 30 | 5802.653 |
| 2013 06 13 21 51 45 | 5802.653 |
| 2013 06 13 21 52 00 | 5802.653 |
| 2013 06 13 21 52 15 | 5802.654 |
| 2013 06 13 21 52 30 | 5802.654 |
| 2013 06 13 21 52 45 | 5802.655 |
| 2013 06 13 21 53 00 | 5802.654 |
| 2013 06 13 21 53 15 | 5802.655 |
| 2013 06 13 21 53 30 | 5802.655 |
| 2013 06 13 21 53 45 | 5802.655 |
| 2013 06 13 21 54 00 | 5802.655 |
| 2013 06 13 21 54 15 | 5802.654 |
| 2013 06 13 21 54 30 | 5802.656 |
| 2013 06 13 21 54 45 | 5802.655 |
| 2013 06 13 21 55 00 | 5802.656 |
| 2013 06 13 21 55 15 | 5802.656 |
| 2013 06 13 21 55 30 | 5802.656 |
| 2013 06 13 21 55 45 | 5802.657 |
| 2013 06 13 21 56 00 | 5802.656 |
| 2013 06 13 21 56 15 | 5802.656 |
| 2013 06 13 21 56 30 | 5802.657 |
| 2013 06 13 21 56 45 | 5802.657 |
| 2013 06 13 21 57 00 | 5802.658 |
| 2013 06 13 21 57 15 | 5802.657 |
| 2013 06 13 21 57 30 | 5802.657 |
| 2013 06 13 21 57 45 | 5802.658 |
| 2013 06 13 21 58 00 | 5802.658 |
| 2013 06 13 21 58 15 | 5802.657 |
| 2013 06 13 21 58 30 | 5802.657 |
| 2013 06 13 21 58 45 | 5802.658 |
| 2013 06 13 21 59 00 | 5802.659 |
| 2013 06 13 21 59 15 | 5802.658 |
| 2013 06 13 21 59 30 | 5802.659 |
| 2013 06 13 21 59 45 | 5802.659 |
| 2013 06 13 22 00 15 | 5802.66 |
| 2013 06 13 22 00 30 | 5802.659 |
| 2013 06 13 22 00 45 | 5802.66 |
| 2013 06 13 22 01 00 | 5802.66 |
| 2013 06 13 22 01 15 | 5802.66 |
| 2013 06 13 22 01 30 | 5802.661 |
| 2013 06 13 22 01 45 | 5802.661 |
| 2013 06 13 22 02 00 | 5802.661 |
| 2013 06 13 22 02 15 | 5802.661 |
| 2013 06 13 22 02 30 | 5802.662 |
| 2013 06 13 22 02 45 | 5802.662 |
| 2013 06 13 22 03 00 | 5802.662 |
| 2013 06 13 22 03 15 | 5802.663 |
| 2013 06 13 22 03 30 | 5802.663 |
| 2013 06 13 22 03 45 | 5802.663 |
| 2013 06 13 22 04 00 | 5802.663 |
| 2013 06 13 22 04 15 | 5802.663 |
| 2013 06 13 22 04 30 | 5802.663 |
| 2013 06 13 22 04 45 | 5802.664 |
| 2013 06 13 22 05 00 | 5802.664 |
| 2013 06 13 22 05 15 | 5802.664 |
| 2013 06 13 22 05 30 | 5802.665 |
| 2013 06 13 22 05 45 | 5802.664 |
| 2013 06 13 22 06 00 | 5802.664 |
| 2013 06 13 22 06 15 | 5802.666 |
| 2013 06 13 22 06 30 | 5802.666 |
| 2013 06 13 22 06 45 | 5802.665 |
| 2013 06 13 22 07 00 | 5802.666 |
| 2013 06 13 22 07 15 | 5802.667 |
| 2013 06 13 22 07 30 | 5802.666 |
| 2013 06 13 22 07 45 | 5802.667 |
| 2013 06 13 22 08 00 | 5802.667 |
| 2013 06 13 22 08 15 | 5802.667 |
| 2013 06 13 22 08 30 | 5802.667 |
| 2013 06 13 22 08 45 | 5802.667 |
| 2013 06 13 22 09 00 | 5802.667 |
| 2013 06 13 22 09 15 | 5802.667 |
| 2013 06 13 22 09 30 | 5802.667 |
| 2013 06 13 22 09 45 | 5802.668 |
| 2013 06 13 22 10 00 | 5802.668 |
| 2013 06 13 22 10 15 | 5802.669 |
| 2013 06 13 22 10 30 | 5802.668 |
| 2013 06 13 22 10 45 | 5802.669 |
| 2013 06 13 22 11 00 | 5802.669 |
| 2013 06 13 22 11 15 | 5802.669 |
| 2013 06 13 22 11 30 | 5802.67 |
| 2013 06 13 22 11 45 | 5802.669 |
| 2013 06 13 22 12 00 | 5802.67 |
| 2013 06 13 22 12 15 | 5802.669 |
| 2013 06 13 22 12 30 | 5802.67 |
| 2013 06 13 22 12 45 | 5802.671 |
| 2013 06 13 22 13 00 | 5802.671 |
| 2013 06 13 22 13 15 | 5802.671 |
| 2013 06 13 22 13 30 | 5802.671 |
| 2013 06 13 22 13 45 | 5802.672 |
| 2013 06 13 22 14 00 | 5802.671 |
| 2013 06 13 22 14 15 | 5802.671 |
| 2013 06 13 22 14 30 | 5802.672 |
| 2013 06 13 22 14 45 | 5802.672 |
| 2013 06 13 22 15 00 | 5802.672 |
| 2013 06 13 22 15 15 | 5802.672 |
| 2013 06 13 22 15 30 | 5802.673 |
| 2013 06 13 22 15 45 | 5802.673 |
| 2013 06 13 22 16 00 | 5802.673 |
| 2013 06 13 22 16 15 | 5802.674 |
| 2013 06 13 22 16 30 | 5802.674 |
| 2013 06 13 22 16 45 | 5802.674 |
| 2013 06 13 22 17 00 | 5802.675 |
| 2013 06 13 22 17 15 | 5802.675 |
| 2013 06 13 22 17 30 | 5802.675 |
| 2013 06 13 22 17 45 | 5802.676 |
| 2013 06 13 22 18 00 | 5802.676 |
| 2013 06 13 22 18 15 | 5802.676 |
| 2013 06 13 22 18 30 | 5802.676 |
| 2013 06 13 22 18 45 | 5802.677 |
| 2013 06 13 22 19 00 | 5802.677 |
| 2013 06 13 22 19 15 | 5802.677 |
| 2013 06 13 22 19 30 | 5802.677 |
| 2013 06 13 22 19 45 | 5802.678 |
| 2013 06 13 22 20 00 | 5802.678 |
| 2013 06 13 22 20 15 | 5802.678 |
| 2013 06 13 22 20 30 | 5802.678 |
| 2013 06 13 22 20 45 | 5802.679 |
| 2013 06 13 22 21 00 | 5802.679 |
| 2013 06 13 22 21 15 | 5802.679 |
| 2013 06 13 22 21 30 | 5802.678 |
| 2013 06 13 22 21 45 | 5802.68 |
| 2013 06 13 22 22 00 | 5802.68 |
| 2013 06 13 22 22 15 | 5802.68 |
| 2013 06 13 22 22 30 | 5802.68 |
| 2013 06 13 22 22 45 | 5802.681 |
| 2013 06 13 22 23 00 | 5802.68 |
| 2013 06 13 22 23 15 | 5802.682 |
| 2013 06 13 22 23 30 | 5802.681 |
| 2013 06 13 22 23 45 | 5802.682 |
| 2013 06 13 22 24 00 | 5802.681 |
| 2013 06 13 22 24 15 | 5802.682 |
| 2013 06 13 22 24 30 | 5802.682 |
| 2013 06 13 22 24 45 | 5802.682 |
| 2013 06 13 22 25 00 | 5802.682 |
| 2013 06 13 22 25 15 | 5802.683 |
| 2013 06 13 22 25 30 | 5802.682 |
| 2013 06 13 22 25 45 | 5802.683 |
| 2013 06 13 22 26 00 | 5802.683 |
| 2013 06 13 22 26 15 | 5802.684 |
| 2013 06 13 22 26 30 | 5802.684 |
| 2013 06 13 22 26 45 | 5802.684 |
| 2013 06 13 22 27 00 | 5802.685 |
| 2013 06 13 22 27 15 | 5802.685 |
| 2013 06 13 22 27 30 | 5802.685 |
| 2013 06 13 22 27 45 | 5802.685 |
| 2013 06 13 22 28 00 | 5802.686 |
| 2013 06 13 22 28 15 | 5802.686 |
| 2013 06 13 22 28 30 | 5802.686 |
| 2013 06 13 22 28 45 | 5802.687 |
| 2013 06 13 22 29 00 | 5802.687 |
| 2013 06 13 22 29 15 | 5802.688 |
| 2013 06 13 22 29 30 | 5802.688 |
| 2013 06 13 22 29 45 | 5802.688 |
| 2013 06 13 22 30 00 | 5802.689 |
| 2013 06 13 22 30 15 | 5802.689 |
| 2013 06 13 22 30 30 | 5802.689 |
| 2013 06 13 22 30 45 | 5802.689 |
| 2013 06 13 22 31 00 | 5802.689 |
| 2013 06 13 22 31 15 | 5802.689 |
| 2013 06 13 22 31 30 | 5802.69 |
| 2013 06 13 22 31 45 | 5802.69 |
| 2013 06 13 22 32 00 | 5802.69 |
| 2013 06 13 22 32 15 | 5802.69 |
| 2013 06 13 22 32 30 | 5802.691 |
| 2013 06 13 22 32 45 | 5802.691 |
| 2013 06 13 22 33 00 | 5802.691 |
| 2013 06 13 22 33 15 | 5802.691 |
| 2013 06 13 22 33 30 | 5802.692 |
| 2013 06 13 22 33 45 | 5802.692 |
| 2013 06 13 22 34 00 | 5802.693 |
| 2013 06 13 22 34 15 | 5802.693 |
| 2013 06 13 22 34 30 | 5802.693 |
| 2013 06 13 22 34 45 | 5802.694 |
| 2013 06 13 22 35 00 | 5802.694 |
| 2013 06 13 22 35 15 | 5802.693 |
| 2013 06 13 22 35 30 | 5802.695 |
| 2013 06 13 22 35 45 | 5802.694 |
| 2013 06 13 22 36 00 | 5802.694 |
| 2013 06 13 22 36 15 | 5802.695 |
| 2013 06 13 22 36 30 | 5802.695 |
| 2013 06 13 22 36 45 | 5802.696 |
| 2013 06 13 22 37 00 | 5802.695 |
| 2013 06 13 22 37 15 | 5802.697 |
| 2013 06 13 22 37 30 | 5802.696 |
| 2013 06 13 22 37 45 | 5802.697 |
| 2013 06 13 22 38 00 | 5802.697 |
| 2013 06 13 22 38 15 | 5802.696 |
| 2013 06 13 22 38 30 | 5802.697 |
| 2013 06 13 22 38 45 | 5802.696 |
| 2013 06 13 22 39 00 | 5802.698 |
| 2013 06 13 22 39 15 | 5802.697 |
| 2013 06 13 22 39 30 | 5802.698 |
| 2013 06 13 22 39 45 | 5802.699 |
| 2013 06 13 22 40 00 | 5802.699 |
| 2013 06 13 22 40 15 | 5802.698 |
| 2013 06 13 22 40 30 | 5802.699 |
| 2013 06 13 22 40 45 | 5802.7 |
| 2013 06 13 22 41 00 | 5802.7 |
| 2013 06 13 22 41 15 | 5802.7 |
| 2013 06 13 22 41 30 | 5802.701 |
| 2013 06 13 22 41 45 | 5802.701 |
| 2013 06 13 22 42 00 | 5802.702 |
| 2013 06 13 22 42 15 | 5802.701 |
| 2013 06 13 22 42 30 | 5802.702 |
| 2013 06 13 22 42 45 | 5802.702 |
| 2013 06 13 22 43 00 | 5802.702 |
| 2013 06 13 22 43 15 | 5802.702 |
| 2013 06 13 22 43 30 | 5802.702 |
| 2013 06 13 22 43 45 | 5802.702 |
| 2013 06 13 22 44 00 | 5802.702 |
| 2013 06 13 22 44 15 | 5802.702 |
| 2013 06 13 22 44 30 | 5802.703 |
| 2013 06 13 22 44 45 | 5802.703 |
| 2013 06 13 22 45 00 | 5802.703 |
| 2013 06 13 22 45 15 | 5802.703 |
| 2013 06 13 22 45 30 | 5802.704 |
| 2013 06 13 22 45 45 | 5802.704 |
| 2013 06 13 22 46 00 | 5802.704 |
| 2013 06 13 22 46 15 | 5802.704 |
| 2013 06 13 22 46 30 | 5802.705 |
| 2013 06 13 22 46 45 | 5802.705 |
| 2013 06 13 22 47 00 | 5802.705 |
| 2013 06 13 22 47 15 | 5802.705 |
| 2013 06 13 22 47 30 | 5802.706 |
| 2013 06 13 22 47 45 | 5802.705 |
| 2013 06 13 22 48 00 | 5802.706 |
| 2013 06 13 22 48 15 | 5802.706 |
| 2013 06 13 22 48 30 | 5802.706 |
| 2013 06 13 22 48 45 | 5802.705 |
| 2013 06 13 22 49 00 | 5802.706 |
| 2013 06 13 22 49 15 | 5802.707 |
| 2013 06 13 22 49 30 | 5802.707 |
| 2013 06 13 22 49 45 | 5802.707 |
| 2013 06 13 22 50 00 | 5802.708 |
| 2013 06 13 22 50 15 | 5802.708 |
| 2013 06 13 22 50 30 | 5802.708 |
| 2013 06 13 22 50 45 | 5802.709 |
| 2013 06 13 22 51 00 | 5802.708 |
| 2013 06 13 22 51 15 | 5802.71 |
| 2013 06 13 22 51 30 | 5802.71 |
| 2013 06 13 22 51 45 | 5802.711 |
| 2013 06 13 22 52 00 | 5802.711 |
| 2013 06 13 22 52 15 | 5802.711 |
| 2013 06 13 22 52 30 | 5802.712 |
| 2013 06 13 22 52 45 | 5802.712 |
| 2013 06 13 22 53 00 | 5802.712 |
| 2013 06 13 22 53 15 | 5802.713 |
| 2013 06 13 22 53 30 | 5802.714 |
| 2013 06 13 22 53 45 | 5802.714 |
| 2013 06 13 22 54 00 | 5802.714 |
| 2013 06 13 22 54 15 | 5802.715 |
| 2013 06 13 22 54 30 | 5802.716 |
| 2013 06 13 22 54 45 | 5802.716 |
| 2013 06 13 22 55 00 | 5802.717 |
| 2013 06 13 22 55 15 | 5802.717 |
| 2013 06 13 22 55 30 | 5802.717 |
| 2013 06 13 22 55 45 | 5802.718 |
| 2013 06 13 22 56 00 | 5802.717 |
| 2013 06 13 22 56 15 | 5802.718 |
| 2013 06 13 22 56 30 | 5802.718 |
| 2013 06 13 22 56 45 | 5802.718 |
| 2013 06 13 22 57 00 | 5802.719 |
| 2013 06 13 22 57 15 | 5802.72 |
| 2013 06 13 22 57 30 | 5802.721 |
| 2013 06 13 22 57 45 | 5802.721 |
| 2013 06 13 22 58 00 | 5802.722 |
| 2013 06 13 22 58 15 | 5802.721 |
| 2013 06 13 22 58 30 | 5802.723 |
| 2013 06 13 22 58 45 | 5802.723 |
| 2013 06 13 22 59 00 | 5802.723 |
| 2013 06 13 22 59 15 | 5802.724 |
| 2013 06 13 22 59 30 | 5802.724 |
| 2013 06 13 22 59 45 | 5802.724 |
| 2013 06 13 23 00 15 | 5802.725 |
| 2013 06 13 23 00 30 | 5802.726 |
| 2013 06 13 23 00 45 | 5802.726 |
| 2013 06 13 23 01 00 | 5802.726 |
| 2013 06 13 23 01 15 | 5802.726 |
| 2013 06 13 23 01 30 | 5802.726 |
| 2013 06 13 23 01 45 | 5802.726 |
| 2013 06 13 23 02 00 | 5802.726 |
| 2013 06 13 23 02 15 | 5802.726 |
| 2013 06 13 23 02 30 | 5802.726 |
| 2013 06 13 23 02 45 | 5802.727 |
| 2013 06 13 23 03 00 | 5802.727 |
| 2013 06 13 23 03 15 | 5802.727 |
| 2013 06 13 23 03 30 | 5802.727 |
| 2013 06 13 23 03 45 | 5802.727 |
| 2013 06 13 23 04 00 | 5802.728 |
| 2013 06 13 23 04 15 | 5802.728 |
| 2013 06 13 23 04 30 | 5802.729 |
| 2013 06 13 23 04 45 | 5802.73 |
| 2013 06 13 23 05 00 | 5802.73 |
| 2013 06 13 23 05 15 | 5802.73 |
| 2013 06 13 23 05 30 | 5802.73 |
| 2013 06 13 23 05 45 | 5802.731 |
| 2013 06 13 23 06 00 | 5802.732 |
| 2013 06 13 23 06 15 | 5802.733 |
| 2013 06 13 23 06 30 | 5802.733 |
| 2013 06 13 23 06 45 | 5802.733 |
| 2013 06 13 23 07 00 | 5802.734 |
| 2013 06 13 23 07 15 | 5802.735 |
| 2013 06 13 23 07 30 | 5802.734 |
| 2013 06 13 23 07 45 | 5802.734 |
| 2013 06 13 23 08 00 | 5802.735 |
| 2013 06 13 23 08 15 | 5802.735 |
| 2013 06 13 23 08 30 | 5802.735 |
| 2013 06 13 23 08 45 | 5802.736 |
| 2013 06 13 23 09 00 | 5802.736 |
| 2013 06 13 23 09 15 | 5802.737 |
| 2013 06 13 23 09 30 | 5802.737 |
| 2013 06 13 23 09 45 | 5802.737 |
| 2013 06 13 23 10 00 | 5802.737 |
| 2013 06 13 23 10 15 | 5802.738 |
| 2013 06 13 23 10 30 | 5802.738 |
| 2013 06 13 23 10 45 | 5802.738 |
| 2013 06 13 23 11 00 | 5802.74 |
| 2013 06 13 23 11 15 | 5802.738 |
| 2013 06 13 23 11 30 | 5802.74 |
| 2013 06 13 23 11 45 | 5802.739 |
| 2013 06 13 23 12 00 | 5802.74 |
| 2013 06 13 23 12 15 | 5802.741 |
| 2013 06 13 23 12 30 | 5802.741 |
| 2013 06 13 23 12 45 | 5802.741 |
| 2013 06 13 23 13 00 | 5802.741 |
| 2013 06 13 23 13 15 | 5802.742 |
| 2013 06 13 23 13 30 | 5802.742 |
| 2013 06 13 23 13 45 | 5802.743 |
| 2013 06 13 23 14 00 | 5802.743 |
| 2013 06 13 23 14 15 | 5802.744 |
| 2013 06 13 23 14 30 | 5802.744 |
| 2013 06 13 23 14 45 | 5802.744 |
| 2013 06 13 23 15 00 | 5802.745 |
| 2013 06 13 23 15 15 | 5802.745 |
| 2013 06 13 23 15 30 | 5802.746 |
| 2013 06 13 23 15 45 | 5802.747 |
| 2013 06 13 23 16 00 | 5802.747 |
| 2013 06 13 23 16 15 | 5802.747 |
| 2013 06 13 23 16 30 | 5802.748 |
| 2013 06 13 23 16 45 | 5802.748 |
| 2013 06 13 23 17 00 | 5802.748 |
| 2013 06 13 23 17 15 | 5802.748 |
| 2013 06 13 23 17 30 | 5802.749 |
| 2013 06 13 23 17 45 | 5802.749 |
| 2013 06 13 23 18 00 | 5802.75 |
| 2013 06 13 23 18 15 | 5802.749 |
| 2013 06 13 23 18 30 | 5802.751 |
| 2013 06 13 23 18 45 | 5802.751 |
| 2013 06 13 23 19 00 | 5802.752 |
| 2013 06 13 23 19 15 | 5802.752 |
| 2013 06 13 23 19 30 | 5802.753 |
| 2013 06 13 23 19 45 | 5802.753 |
| 2013 06 13 23 20 00 | 5802.753 |
| 2013 06 13 23 20 15 | 5802.754 |
| 2013 06 13 23 20 30 | 5802.755 |
| 2013 06 13 23 20 45 | 5802.754 |
| 2013 06 13 23 21 00 | 5802.755 |
| 2013 06 13 23 21 15 | 5802.755 |
| 2013 06 13 23 21 30 | 5802.756 |
| 2013 06 13 23 21 45 | 5802.756 |
| 2013 06 13 23 22 00 | 5802.756 |
| 2013 06 13 23 22 15 | 5802.756 |
| 2013 06 13 23 22 30 | 5802.756 |
| 2013 06 13 23 22 45 | 5802.757 |
| 2013 06 13 23 23 00 | 5802.757 |
| 2013 06 13 23 23 15 | 5802.757 |
| 2013 06 13 23 23 30 | 5802.757 |
| 2013 06 13 23 23 45 | 5802.758 |
| 2013 06 13 23 24 00 | 5802.758 |
| 2013 06 13 23 24 15 | 5802.758 |
| 2013 06 13 23 24 30 | 5802.758 |
| 2013 06 13 23 24 45 | 5802.759 |
| 2013 06 13 23 25 00 | 5802.759 |
| 2013 06 13 23 25 15 | 5802.759 |
| 2013 06 13 23 25 30 | 5802.76 |
| 2013 06 13 23 25 45 | 5802.761 |
| 2013 06 13 23 26 00 | 5802.761 |
| 2013 06 13 23 26 15 | 5802.761 |
| 2013 06 13 23 26 30 | 5802.761 |
| 2013 06 13 23 26 45 | 5802.762 |
| 2013 06 13 23 27 00 | 5802.762 |
| 2013 06 13 23 27 15 | 5802.762 |
| 2013 06 13 23 27 30 | 5802.763 |
| 2013 06 13 23 27 45 | 5802.763 |
| 2013 06 13 23 28 00 | 5802.763 |
| 2013 06 13 23 28 15 | 5802.764 |
| 2013 06 13 23 28 30 | 5802.763 |
| 2013 06 13 23 28 45 | 5802.764 |
| 2013 06 13 23 29 00 | 5802.764 |
| 2013 06 13 23 29 15 | 5802.765 |
| 2013 06 13 23 29 30 | 5802.765 |
| 2013 06 13 23 29 45 | 5802.766 |
| 2013 06 13 23 30 00 | 5802.766 |
| 2013 06 13 23 30 15 | 5802.767 |
| 2013 06 13 23 30 30 | 5802.767 |
| 2013 06 13 23 30 45 | 5802.767 |
| 2013 06 13 23 31 00 | 5802.768 |
| 2013 06 13 23 31 15 | 5802.769 |
| 2013 06 13 23 31 30 | 5802.769 |
| 2013 06 13 23 31 45 | 5802.769 |
| 2013 06 13 23 32 00 | 5802.769 |
| 2013 06 13 23 32 15 | 5802.77 |
| 2013 06 13 23 32 30 | 5802.77 |
| 2013 06 13 23 32 45 | 5802.77 |
| 2013 06 13 23 33 00 | 5802.771 |
| 2013 06 13 23 33 15 | 5802.771 |
| 2013 06 13 23 33 30 | 5802.771 |
| 2013 06 13 23 33 45 | 5802.772 |
| 2013 06 13 23 34 00 | 5802.773 |
| 2013 06 13 23 34 15 | 5802.773 |
| 2013 06 13 23 34 30 | 5802.774 |
| 2013 06 13 23 34 45 | 5802.774 |
| 2013 06 13 23 35 00 | 5802.774 |
| 2013 06 13 23 35 15 | 5802.774 |
| 2013 06 13 23 35 30 | 5802.775 |
| 2013 06 13 23 35 45 | 5802.776 |
| 2013 06 13 23 36 00 | 5802.776 |
| 2013 06 13 23 36 15 | 5802.777 |
| 2013 06 13 23 36 30 | 5802.777 |
| 2013 06 13 23 36 45 | 5802.778 |
| 2013 06 13 23 37 00 | 5802.778 |
| 2013 06 13 23 37 15 | 5802.779 |
| 2013 06 13 23 37 30 | 5802.779 |
| 2013 06 13 23 37 45 | 5802.78 |
| 2013 06 13 23 38 00 | 5802.78 |
| 2013 06 13 23 38 15 | 5802.78 |
| 2013 06 13 23 38 30 | 5802.78 |
| 2013 06 13 23 38 45 | 5802.781 |
| 2013 06 13 23 39 00 | 5802.782 |
| 2013 06 13 23 39 15 | 5802.782 |
| 2013 06 13 23 39 30 | 5802.782 |
| 2013 06 13 23 39 45 | 5802.783 |
| 2013 06 13 23 40 00 | 5802.784 |
| 2013 06 13 23 40 15 | 5802.784 |
| 2013 06 13 23 40 30 | 5802.784 |
| 2013 06 13 23 40 45 | 5802.785 |
| 2013 06 13 23 41 00 | 5802.785 |
| 2013 06 13 23 41 15 | 5802.785 |
| 2013 06 13 23 41 30 | 5802.785 |
| 2013 06 13 23 41 45 | 5802.786 |
| 2013 06 13 23 42 00 | 5802.786 |
| 2013 06 13 23 42 15 | 5802.786 |
| 2013 06 13 23 42 30 | 5802.786 |
| 2013 06 13 23 42 45 | 5802.787 |
| 2013 06 13 23 43 00 | 5802.787 |
| 2013 06 13 23 43 15 | 5802.787 |
| 2013 06 13 23 43 30 | 5802.788 |
| 2013 06 13 23 43 45 | 5802.788 |
| 2013 06 13 23 44 00 | 5802.788 |
| 2013 06 13 23 44 15 | 5802.788 |
| 2013 06 13 23 44 30 | 5802.789 |
| 2013 06 13 23 44 45 | 5802.789 |
| 2013 06 13 23 45 00 | 5802.789 |
| 2013 06 13 23 45 15 | 5802.789 |
| 2013 06 13 23 45 30 | 5802.79 |
| 2013 06 13 23 45 45 | 5802.79 |
| 2013 06 13 23 46 00 | 5802.79 |
| 2013 06 13 23 46 15 | 5802.791 |
| 2013 06 13 23 46 30 | 5802.791 |
| 2013 06 13 23 46 45 | 5802.792 |
| 2013 06 13 23 47 00 | 5802.792 |
| 2013 06 13 23 47 15 | 5802.793 |
| 2013 06 13 23 47 30 | 5802.792 |
| 2013 06 13 23 47 45 | 5802.794 |
| 2013 06 13 23 48 00 | 5802.794 |
| 2013 06 13 23 48 15 | 5802.794 |
| 2013 06 13 23 48 30 | 5802.795 |
| 2013 06 13 23 48 45 | 5802.794 |
| 2013 06 13 23 49 00 | 5802.795 |
| 2013 06 13 23 49 15 | 5802.796 |
| 2013 06 13 23 49 30 | 5802.796 |
| 2013 06 13 23 49 45 | 5802.797 |
| 2013 06 13 23 50 00 | 5802.797 |
| 2013 06 13 23 50 15 | 5802.798 |
| 2013 06 13 23 50 30 | 5802.798 |
| 2013 06 13 23 50 45 | 5802.799 |
| 2013 06 13 23 51 00 | 5802.8 |
| 2013 06 13 23 51 15 | 5802.8 |
| 2013 06 13 23 51 30 | 5802.8 |
| 2013 06 13 23 51 45 | 5802.8 |
| 2013 06 13 23 52 00 | 5802.801 |
| 2013 06 13 23 52 15 | 5802.802 |
| 2013 06 13 23 52 30 | 5802.802 |
| 2013 06 13 23 52 45 | 5802.802 |
| 2013 06 13 23 53 00 | 5802.802 |
| 2013 06 13 23 53 15 | 5802.802 |
| 2013 06 13 23 53 30 | 5802.803 |
| 2013 06 13 23 53 45 | 5802.804 |
| 2013 06 13 23 54 00 | 5802.803 |
| 2013 06 13 23 54 15 | 5802.805 |
| 2013 06 13 23 54 30 | 5802.804 |
| 2013 06 13 23 54 45 | 5802.805 |
| 2013 06 13 23 55 00 | 5802.806 |
| 2013 06 13 23 55 15 | 5802.805 |
| 2013 06 13 23 55 30 | 5802.806 |
| 2013 06 13 23 55 45 | 5802.806 |
| 2013 06 13 23 56 00 | 5802.807 |
| 2013 06 13 23 56 15 | 5802.807 |
| 2013 06 13 23 56 30 | 5802.807 |
| 2013 06 13 23 56 45 | 5802.808 |
| 2013 06 13 23 57 00 | 5802.808 |
| 2013 06 13 23 57 15 | 5802.808 |
| 2013 06 13 23 57 30 | 5802.81 |
| 2013 06 13 23 57 45 | 5802.81 |
| 2013 06 13 23 58 00 | 5802.81 |
| 2013 06 13 23 58 15 | 5802.81 |
| 2013 06 13 23 58 30 | 5802.81 |
| 2013 06 13 23 58 45 | 5802.811 |
| 2013 06 13 23 59 00 | 5802.811 |
| 2013 06 13 23 59 15 | 5802.811 |
| 2013 06 13 23 59 30 | 5802.812 |
| 2013 06 13 23 59 45 | 5802.812 |
| 2013 06 14 00 00 15 | 5802.813 |
| 2013 06 14 00 00 30 | 5802.814 |
| 2013 06 14 00 00 45 | 5802.814 |
| 2013 06 14 00 01 00 | 5802.814 |
| 2013 06 14 00 01 15 | 5802.814 |
| 2013 06 14 00 01 30 | 5802.815 |
| 2013 06 14 00 01 45 | 5802.815 |
| 2013 06 14 00 02 00 | 5802.815 |
| 2013 06 14 00 02 15 | 5802.816 |
| 2013 06 14 00 02 30 | 5802.816 |
| 2013 06 14 00 02 45 | 5802.817 |
| 2013 06 14 00 03 00 | 5802.817 |
| 2013 06 14 00 03 15 | 5802.817 |
| 2013 06 14 00 03 30 | 5802.818 |
| 2013 06 14 00 03 45 | 5802.818 |
| 2013 06 14 00 04 00 | 5802.819 |
| 2013 06 14 00 04 15 | 5802.818 |
| 2013 06 14 00 04 30 | 5802.82 |
| 2013 06 14 00 04 45 | 5802.82 |
| 2013 06 14 00 05 00 | 5802.82 |
| 2013 06 14 00 05 15 | 5802.82 |
| 2013 06 14 00 05 30 | 5802.821 |
| 2013 06 14 00 05 45 | 5802.821 |
| 2013 06 14 00 06 00 | 5802.822 |
| 2013 06 14 00 06 15 | 5802.823 |
| 2013 06 14 00 06 30 | 5802.823 |
| 2013 06 14 00 06 45 | 5802.824 |
| 2013 06 14 00 07 00 | 5802.824 |
| 2013 06 14 00 07 15 | 5802.825 |
| 2013 06 14 00 07 30 | 5802.825 |
| 2013 06 14 00 07 45 | 5802.825 |
| 2013 06 14 00 08 00 | 5802.826 |
| 2013 06 14 00 08 15 | 5802.826 |
| 2013 06 14 00 08 30 | 5802.827 |
| 2013 06 14 00 08 45 | 5802.827 |
| 2013 06 14 00 09 00 | 5802.828 |
| 2013 06 14 00 09 15 | 5802.828 |
| 2013 06 14 00 09 30 | 5802.829 |
| 2013 06 14 00 09 45 | 5802.829 |
| 2013 06 14 00 10 00 | 5802.83 |
| 2013 06 14 00 10 15 | 5802.83 |
| 2013 06 14 00 10 30 | 5802.83 |
| 2013 06 14 00 10 45 | 5802.831 |
| 2013 06 14 00 11 00 | 5802.831 |
| 2013 06 14 00 11 15 | 5802.831 |
| 2013 06 14 00 11 30 | 5802.832 |
| 2013 06 14 00 11 45 | 5802.832 |
| 2013 06 14 00 12 00 | 5802.832 |
| 2013 06 14 00 12 15 | 5802.833 |
| 2013 06 14 00 12 30 | 5802.833 |
| 2013 06 14 00 12 45 | 5802.834 |
| 2013 06 14 00 13 00 | 5802.833 |
| 2013 06 14 00 13 15 | 5802.834 |
| 2013 06 14 00 13 30 | 5802.834 |
| 2013 06 14 00 13 45 | 5802.835 |
| 2013 06 14 00 14 00 | 5802.836 |
| 2013 06 14 00 14 15 | 5802.835 |
| 2013 06 14 00 14 30 | 5802.837 |
| 2013 06 14 00 14 45 | 5802.837 |
| 2013 06 14 00 15 00 | 5802.838 |
| 2013 06 14 00 15 15 | 5802.838 |
| 2013 06 14 00 15 30 | 5802.838 |
| 2013 06 14 00 15 45 | 5802.839 |
| 2013 06 14 00 16 00 | 5802.839 |
| 2013 06 14 00 16 15 | 5802.84 |
| 2013 06 14 00 16 30 | 5802.84 |
| 2013 06 14 00 16 45 | 5802.841 |
| 2013 06 14 00 17 00 | 5802.841 |
| 2013 06 14 00 17 15 | 5802.842 |
| 2013 06 14 00 17 30 | 5802.842 |
| 2013 06 14 00 17 45 | 5802.842 |
| 2013 06 14 00 18 00 | 5802.843 |
| 2013 06 14 00 18 15 | 5802.844 |
| 2013 06 14 00 18 30 | 5802.845 |
| 2013 06 14 00 18 45 | 5802.845 |
| 2013 06 14 00 19 00 | 5802.846 |
| 2013 06 14 00 19 15 | 5802.846 |
| 2013 06 14 00 19 30 | 5802.846 |
| 2013 06 14 00 19 45 | 5802.847 |
| 2013 06 14 00 20 00 | 5802.847 |
| 2013 06 14 00 20 15 | 5802.848 |
| 2013 06 14 00 20 30 | 5802.848 |
| 2013 06 14 00 20 45 | 5802.849 |
| 2013 06 14 00 21 00 | 5802.849 |
| 2013 06 14 00 21 15 | 5802.849 |
| 2013 06 14 00 21 30 | 5802.85 |
| 2013 06 14 00 21 45 | 5802.851 |
| 2013 06 14 00 22 00 | 5802.852 |
| 2013 06 14 00 22 15 | 5802.852 |
| 2013 06 14 00 22 30 | 5802.852 |
| 2013 06 14 00 22 45 | 5802.852 |
| 2013 06 14 00 23 00 | 5802.853 |
| 2013 06 14 00 23 15 | 5802.854 |
| 2013 06 14 00 23 30 | 5802.854 |
| 2013 06 14 00 23 45 | 5802.855 |
| 2013 06 14 00 24 00 | 5802.855 |
| 2013 06 14 00 24 15 | 5802.855 |
| 2013 06 14 00 24 30 | 5802.855 |
| 2013 06 14 00 24 45 | 5802.856 |
| 2013 06 14 00 25 00 | 5802.856 |
| 2013 06 14 00 25 15 | 5802.857 |
| 2013 06 14 00 25 30 | 5802.858 |
| 2013 06 14 00 25 45 | 5802.858 |
| 2013 06 14 00 26 00 | 5802.858 |
| 2013 06 14 00 26 15 | 5802.86 |
| 2013 06 14 00 26 30 | 5802.86 |
| 2013 06 14 00 26 45 | 5802.86 |
| 2013 06 14 00 27 00 | 5802.861 |
| 2013 06 14 00 27 15 | 5802.862 |
| 2013 06 14 00 27 30 | 5802.862 |
| 2013 06 14 00 27 45 | 5802.863 |
| 2013 06 14 00 28 00 | 5802.863 |
| 2013 06 14 00 28 15 | 5802.863 |
| 2013 06 14 00 28 30 | 5802.865 |
| 2013 06 14 00 28 45 | 5802.864 |
| 2013 06 14 00 29 00 | 5802.865 |
| 2013 06 14 00 29 15 | 5802.865 |
| 2013 06 14 00 29 30 | 5802.866 |
| 2013 06 14 00 29 45 | 5802.866 |
| 2013 06 14 00 30 00 | 5802.868 |
| 2013 06 14 00 30 15 | 5802.868 |
| 2013 06 14 00 30 30 | 5802.869 |
| 2013 06 14 00 30 45 | 5802.869 |
| 2013 06 14 00 31 00 | 5802.87 |
| 2013 06 14 00 31 15 | 5802.87 |
| 2013 06 14 00 31 30 | 5802.871 |
| 2013 06 14 00 31 45 | 5802.871 |
| 2013 06 14 00 32 00 | 5802.871 |
| 2013 06 14 00 32 15 | 5802.872 |
| 2013 06 14 00 32 30 | 5802.872 |
| 2013 06 14 00 32 45 | 5802.872 |
| 2013 06 14 00 33 00 | 5802.872 |
| 2013 06 14 00 33 15 | 5802.873 |
| 2013 06 14 00 33 30 | 5802.873 |
| 2013 06 14 00 33 45 | 5802.874 |
| 2013 06 14 00 34 00 | 5802.874 |
| 2013 06 14 00 34 15 | 5802.874 |
| 2013 06 14 00 34 30 | 5802.874 |
| 2013 06 14 00 34 45 | 5802.875 |
| 2013 06 14 00 35 00 | 5802.876 |
| 2013 06 14 00 35 15 | 5802.876 |
| 2013 06 14 00 35 30 | 5802.876 |
| 2013 06 14 00 35 45 | 5802.877 |
| 2013 06 14 00 36 00 | 5802.877 |
| 2013 06 14 00 36 15 | 5802.877 |
| 2013 06 14 00 36 30 | 5802.878 |
| 2013 06 14 00 36 45 | 5802.88 |
| 2013 06 14 00 37 00 | 5802.88 |
| 2013 06 14 00 37 15 | 5802.88 |
| 2013 06 14 00 37 30 | 5802.88 |
| 2013 06 14 00 37 45 | 5802.88 |
| 2013 06 14 00 38 00 | 5802.881 |
| 2013 06 14 00 38 15 | 5802.881 |
| 2013 06 14 00 38 30 | 5802.881 |
| 2013 06 14 00 38 45 | 5802.882 |
| 2013 06 14 00 39 00 | 5802.882 |
| 2013 06 14 00 39 15 | 5802.883 |
| 2013 06 14 00 39 30 | 5802.883 |
| 2013 06 14 00 39 45 | 5802.884 |
| 2013 06 14 00 40 00 | 5802.884 |
| 2013 06 14 00 40 15 | 5802.885 |
| 2013 06 14 00 40 30 | 5802.886 |
| 2013 06 14 00 40 45 | 5802.887 |
| 2013 06 14 00 41 00 | 5802.887 |
| 2013 06 14 00 41 15 | 5802.888 |
| 2013 06 14 00 41 30 | 5802.887 |
| 2013 06 14 00 41 45 | 5802.888 |
| 2013 06 14 00 42 00 | 5802.888 |
| 2013 06 14 00 42 15 | 5802.889 |
| 2013 06 14 00 42 30 | 5802.889 |
| 2013 06 14 00 42 45 | 5802.89 |
| 2013 06 14 00 43 00 | 5802.889 |
| 2013 06 14 00 43 15 | 5802.891 |
| 2013 06 14 00 43 30 | 5802.891 |
| 2013 06 14 00 43 45 | 5802.891 |
| 2013 06 14 00 44 00 | 5802.892 |
| 2013 06 14 00 44 15 | 5802.893 |
| 2013 06 14 00 44 30 | 5802.892 |
| 2013 06 14 00 44 45 | 5802.893 |
| 2013 06 14 00 45 00 | 5802.894 |
| 2013 06 14 00 45 15 | 5802.894 |
| 2013 06 14 00 45 30 | 5802.895 |
| 2013 06 14 00 45 45 | 5802.895 |
| 2013 06 14 00 46 00 | 5802.895 |
| 2013 06 14 00 46 15 | 5802.896 |
| 2013 06 14 00 46 30 | 5802.897 |
| 2013 06 14 00 46 45 | 5802.897 |
| 2013 06 14 00 47 00 | 5802.897 |
| 2013 06 14 00 47 15 | 5802.898 |
| 2013 06 14 00 47 30 | 5802.898 |
| 2013 06 14 00 47 45 | 5802.898 |
| 2013 06 14 00 48 00 | 5802.899 |
| 2013 06 14 00 48 15 | 5802.9 |
| 2013 06 14 00 48 30 | 5802.9 |
| 2013 06 14 00 48 45 | 5802.9 |
| 2013 06 14 00 49 00 | 5802.901 |
| 2013 06 14 00 49 15 | 5802.901 |
| 2013 06 14 00 49 30 | 5802.902 |
| 2013 06 14 00 49 45 | 5802.901 |
| 2013 06 14 00 50 00 | 5802.903 |
| 2013 06 14 00 50 15 | 5802.902 |
| 2013 06 14 00 50 30 | 5802.903 |
| 2013 06 14 00 50 45 | 5802.904 |
| 2013 06 14 00 51 00 | 5802.904 |
| 2013 06 14 00 51 15 | 5802.904 |
| 2013 06 14 00 51 30 | 5802.905 |
| 2013 06 14 00 51 45 | 5802.905 |
| 2013 06 14 00 52 00 | 5802.905 |
| 2013 06 14 00 52 15 | 5802.905 |
| 2013 06 14 00 52 30 | 5802.906 |
| 2013 06 14 00 52 45 | 5802.906 |
| 2013 06 14 00 53 00 | 5802.905 |
| 2013 06 14 00 53 15 | 5802.906 |
| 2013 06 14 00 53 30 | 5802.906 |
| 2013 06 14 00 53 45 | 5802.907 |
| 2013 06 14 00 54 00 | 5802.907 |
| 2013 06 14 00 54 15 | 5802.907 |
| 2013 06 14 00 54 30 | 5802.907 |
| 2013 06 14 00 54 45 | 5802.908 |
| 2013 06 14 00 55 00 | 5802.908 |
| 2013 06 14 00 55 15 | 5802.909 |
| 2013 06 14 00 55 30 | 5802.909 |
| 2013 06 14 00 55 45 | 5802.909 |
| 2013 06 14 00 56 00 | 5802.909 |
| 2013 06 14 00 56 15 | 5802.91 |
| 2013 06 14 00 56 30 | 5802.91 |
| 2013 06 14 00 56 45 | 5802.911 |
| 2013 06 14 00 57 00 | 5802.911 |
| 2013 06 14 00 57 15 | 5802.912 |
| 2013 06 14 00 57 30 | 5802.912 |
| 2013 06 14 00 57 45 | 5802.912 |
| 2013 06 14 00 58 00 | 5802.912 |
| 2013 06 14 00 58 15 | 5802.913 |
| 2013 06 14 00 58 30 | 5802.913 |
| 2013 06 14 00 58 45 | 5802.914 |
| 2013 06 14 00 59 00 | 5802.913 |
| 2013 06 14 00 59 15 | 5802.914 |
| 2013 06 14 00 59 30 | 5802.915 |
| 2013 06 14 00 59 45 | 5802.914 |